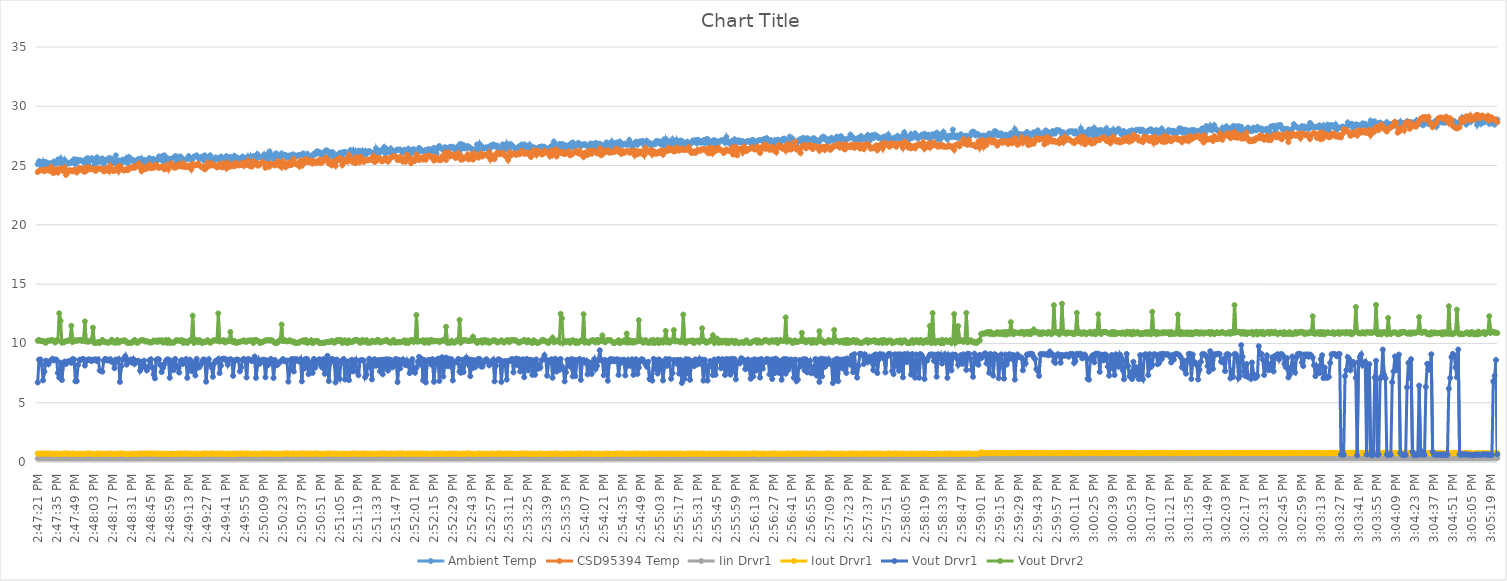
| Category | Ambient Temp | CSD95394 Temp | Iin Drvr1 | Iout Drvr1 | Vout Drvr1 | Vout Drvr2 |
|---|---|---|---|---|---|---|
| 0.616215277777816 | 25.106 | 24.447 | 0.298 | 0.714 | 6.706 | 10.23 |
| 0.61622685185189 | 25.369 | 24.546 | 0.292 | 0.696 | 8.622 | 10.301 |
| 0.616238425925964 | 25.303 | 24.612 | 0.298 | 0.71 | 8.658 | 10.217 |
| 0.616250000000038 | 24.908 | 24.612 | 0.299 | 0.72 | 8.225 | 10.19 |
| 0.616261574074112 | 25.336 | 24.612 | 0.299 | 0.716 | 6.888 | 10.207 |
| 0.616273148148186 | 24.974 | 24.513 | 0.301 | 0.719 | 7.621 | 10.135 |
| 0.61628472222226 | 25.303 | 24.678 | 0.291 | 0.689 | 8.546 | 10.045 |
| 0.616296296296334 | 25.138 | 24.678 | 0.3 | 0.718 | 8.482 | 10.218 |
| 0.616307870370408 | 25.171 | 24.579 | 0.298 | 0.709 | 8.239 | 10.237 |
| 0.616319444444482 | 25.204 | 24.579 | 0.3 | 0.717 | 8.493 | 10.237 |
| 0.616331018518556 | 25.04 | 24.875 | 0.295 | 0.7 | 8.594 | 10.271 |
| 0.61634259259263 | 25.04 | 24.414 | 0.285 | 0.68 | 8.71 | 10.281 |
| 0.616354166666704 | 25.336 | 24.381 | 0.286 | 0.678 | 8.574 | 10.189 |
| 0.616365740740778 | 25.171 | 24.612 | 0.293 | 0.693 | 8.633 | 10.072 |
| 0.616377314814852 | 25.171 | 24.678 | 0.297 | 0.709 | 8.636 | 10.263 |
| 0.616388888888927 | 25.501 | 24.414 | 0.296 | 0.704 | 7.507 | 10.255 |
| 0.616400462963001 | 25.336 | 24.711 | 0.282 | 0.669 | 7.115 | 12.547 |
| 0.616412037037075 | 25.599 | 24.776 | 0.286 | 0.681 | 8.379 | 11.914 |
| 0.616423611111149 | 25.073 | 24.645 | 0.293 | 0.695 | 6.905 | 10.059 |
| 0.616435185185223 | 25.04 | 24.546 | 0.297 | 0.71 | 8.222 | 10.088 |
| 0.616446759259297 | 25.468 | 24.809 | 0.299 | 0.707 | 8.464 | 10.111 |
| 0.616458333333371 | 25.138 | 24.217 | 0.301 | 0.721 | 8.262 | 10.197 |
| 0.616469907407445 | 25.138 | 24.381 | 0.299 | 0.716 | 8.448 | 10.201 |
| 0.616481481481519 | 25.237 | 24.579 | 0.297 | 0.705 | 8.506 | 10.27 |
| 0.616493055555593 | 25.237 | 24.612 | 0.285 | 0.679 | 8.491 | 10.26 |
| 0.616504629629667 | 25.237 | 24.546 | 0.285 | 0.677 | 8.368 | 11.486 |
| 0.616516203703741 | 25.402 | 24.513 | 0.299 | 0.716 | 8.686 | 10.122 |
| 0.616527777777815 | 25.534 | 24.645 | 0.294 | 0.702 | 8.636 | 10.26 |
| 0.616539351851889 | 25.138 | 24.612 | 0.285 | 0.68 | 6.804 | 10.256 |
| 0.616550925925963 | 25.501 | 24.414 | 0.287 | 0.68 | 6.82 | 10.214 |
| 0.616562500000037 | 25.336 | 24.612 | 0.288 | 0.682 | 8.198 | 10.278 |
| 0.616574074074111 | 25.468 | 24.809 | 0.292 | 0.698 | 8.626 | 10.286 |
| 0.616585648148185 | 25.435 | 24.645 | 0.291 | 0.692 | 8.597 | 10.308 |
| 0.616597222222259 | 25.402 | 24.743 | 0.285 | 0.682 | 8.678 | 10.197 |
| 0.616608796296333 | 25.303 | 24.513 | 0.288 | 0.689 | 8.68 | 10.303 |
| 0.616620370370407 | 25.171 | 24.48 | 0.284 | 0.676 | 8.134 | 11.857 |
| 0.616631944444481 | 25.566 | 24.842 | 0.298 | 0.715 | 8.486 | 10.155 |
| 0.616643518518555 | 25.632 | 24.612 | 0.3 | 0.72 | 8.625 | 10.183 |
| 0.616655092592629 | 24.974 | 24.842 | 0.301 | 0.716 | 8.657 | 10.152 |
| 0.616666666666703 | 25.435 | 24.776 | 0.3 | 0.713 | 8.634 | 10.223 |
| 0.616678240740777 | 25.632 | 24.678 | 0.288 | 0.684 | 8.503 | 10.285 |
| 0.616689814814852 | 25.501 | 24.711 | 0.281 | 0.67 | 8.63 | 11.331 |
| 0.616701388888926 | 25.007 | 24.743 | 0.287 | 0.68 | 8.596 | 10.036 |
| 0.616712962963 | 25.204 | 24.546 | 0.282 | 0.669 | 8.662 | 10.037 |
| 0.616724537037074 | 25.698 | 24.743 | 0.297 | 0.704 | 8.51 | 10.079 |
| 0.616736111111148 | 25.27 | 24.711 | 0.299 | 0.711 | 8.649 | 10.119 |
| 0.616747685185222 | 25.336 | 24.743 | 0.289 | 0.688 | 7.722 | 10.023 |
| 0.616759259259296 | 25.501 | 24.743 | 0.298 | 0.708 | 7.68 | 10.128 |
| 0.61677083333337 | 25.599 | 24.678 | 0.291 | 0.691 | 7.615 | 10.297 |
| 0.616782407407444 | 25.138 | 24.513 | 0.285 | 0.678 | 8.518 | 10.142 |
| 0.616793981481518 | 25.303 | 24.546 | 0.284 | 0.676 | 8.688 | 10.134 |
| 0.616805555555592 | 25.501 | 24.776 | 0.296 | 0.706 | 8.665 | 10.098 |
| 0.616817129629666 | 25.468 | 24.776 | 0.292 | 0.694 | 8.559 | 10.064 |
| 0.61682870370374 | 25.632 | 24.513 | 0.295 | 0.704 | 8.57 | 10.072 |
| 0.616840277777814 | 25.27 | 25.007 | 0.298 | 0.714 | 8.674 | 10.172 |
| 0.616851851851888 | 25.566 | 24.711 | 0.291 | 0.693 | 8.447 | 10.315 |
| 0.616863425925962 | 25.336 | 24.546 | 0.281 | 0.669 | 8.427 | 10.101 |
| 0.616875000000036 | 25.204 | 24.579 | 0.283 | 0.667 | 7.906 | 10.075 |
| 0.61688657407411 | 25.863 | 24.678 | 0.291 | 0.69 | 8.636 | 10.062 |
| 0.616898148148184 | 25.402 | 24.842 | 0.291 | 0.697 | 8.515 | 10.291 |
| 0.616909722222258 | 24.941 | 24.513 | 0.289 | 0.693 | 8.671 | 10.06 |
| 0.616921296296332 | 25.402 | 24.974 | 0.301 | 0.718 | 6.752 | 10.135 |
| 0.616932870370406 | 25.204 | 24.776 | 0.3 | 0.716 | 8.08 | 10.213 |
| 0.61694444444448 | 25.501 | 24.678 | 0.299 | 0.713 | 8.652 | 10.218 |
| 0.616956018518554 | 25.336 | 24.579 | 0.287 | 0.681 | 8.663 | 10.262 |
| 0.616967592592628 | 25.336 | 24.612 | 0.285 | 0.681 | 8.932 | 10.253 |
| 0.616979166666702 | 25.632 | 24.711 | 0.287 | 0.679 | 8.212 | 10.078 |
| 0.616990740740777 | 25.204 | 24.612 | 0.282 | 0.672 | 8.603 | 10.047 |
| 0.617002314814851 | 25.698 | 24.809 | 0.283 | 0.671 | 8.464 | 10.063 |
| 0.617013888888925 | 25.468 | 24.776 | 0.282 | 0.665 | 8.633 | 10.048 |
| 0.617025462962999 | 25.501 | 24.809 | 0.294 | 0.698 | 8.39 | 10.06 |
| 0.617037037037073 | 25.369 | 24.941 | 0.298 | 0.711 | 8.673 | 10.191 |
| 0.617048611111147 | 25.435 | 24.809 | 0.292 | 0.696 | 8.284 | 10.299 |
| 0.617060185185221 | 25.336 | 24.941 | 0.285 | 0.682 | 8.531 | 10.094 |
| 0.617071759259295 | 25.468 | 24.941 | 0.28 | 0.662 | 8.499 | 10.041 |
| 0.617083333333369 | 25.566 | 25.171 | 0.299 | 0.715 | 8.529 | 10.13 |
| 0.617094907407443 | 25.204 | 24.842 | 0.296 | 0.711 | 7.699 | 10.232 |
| 0.617106481481517 | 25.566 | 24.546 | 0.292 | 0.699 | 7.935 | 10.293 |
| 0.617118055555591 | 25.171 | 24.908 | 0.293 | 0.703 | 8.47 | 10.268 |
| 0.617129629629665 | 25.468 | 24.678 | 0.299 | 0.71 | 8.54 | 10.24 |
| 0.617141203703739 | 25.204 | 24.711 | 0.301 | 0.714 | 7.98 | 10.158 |
| 0.617152777777813 | 25.171 | 24.743 | 0.301 | 0.721 | 7.724 | 10.185 |
| 0.617164351851887 | 25.534 | 24.974 | 0.3 | 0.719 | 7.964 | 10.156 |
| 0.617175925925961 | 25.632 | 25.106 | 0.297 | 0.71 | 8.581 | 10.088 |
| 0.617187500000035 | 25.468 | 24.776 | 0.293 | 0.696 | 8.668 | 10.069 |
| 0.617199074074109 | 25.402 | 24.842 | 0.3 | 0.712 | 7.971 | 10.102 |
| 0.617210648148183 | 25.566 | 24.809 | 0.296 | 0.704 | 7.381 | 10.248 |
| 0.617222222222257 | 25.402 | 25.04 | 0.301 | 0.722 | 7.051 | 10.17 |
| 0.617233796296331 | 25.468 | 25.073 | 0.297 | 0.706 | 8.617 | 10.242 |
| 0.617245370370405 | 25.435 | 24.842 | 0.296 | 0.704 | 8.674 | 10.117 |
| 0.617256944444479 | 25.764 | 24.809 | 0.283 | 0.677 | 8.655 | 10.263 |
| 0.617268518518553 | 25.534 | 24.875 | 0.299 | 0.718 | 8.196 | 10.186 |
| 0.617280092592628 | 25.764 | 24.908 | 0.287 | 0.689 | 7.582 | 10.274 |
| 0.617291666666702 | 25.369 | 24.941 | 0.28 | 0.665 | 7.935 | 10.065 |
| 0.617303240740776 | 25.863 | 24.678 | 0.299 | 0.712 | 8.247 | 10.119 |
| 0.61731481481485 | 25.369 | 24.809 | 0.29 | 0.692 | 8.515 | 10.283 |
| 0.617326388888924 | 25.632 | 25.04 | 0.286 | 0.684 | 8.649 | 10.057 |
| 0.617337962962998 | 25.566 | 24.678 | 0.285 | 0.676 | 8.647 | 10.282 |
| 0.617349537037072 | 25.369 | 25.073 | 0.284 | 0.674 | 7.099 | 10.048 |
| 0.617361111111146 | 25.566 | 25.204 | 0.299 | 0.709 | 8.534 | 10.106 |
| 0.61737268518522 | 25.599 | 25.007 | 0.291 | 0.689 | 8.478 | 10.046 |
| 0.617384259259294 | 25.665 | 24.842 | 0.283 | 0.668 | 7.742 | 10.068 |
| 0.617395833333368 | 25.797 | 24.809 | 0.286 | 0.678 | 8.692 | 10.191 |
| 0.617407407407442 | 25.237 | 24.974 | 0.291 | 0.692 | 8.052 | 10.293 |
| 0.617418981481516 | 25.731 | 24.908 | 0.298 | 0.708 | 8.08 | 10.251 |
| 0.61743055555559 | 25.534 | 25.138 | 0.299 | 0.717 | 7.542 | 10.219 |
| 0.617442129629664 | 25.764 | 25.007 | 0.296 | 0.709 | 8.515 | 10.251 |
| 0.617453703703738 | 25.599 | 24.908 | 0.286 | 0.679 | 8.605 | 10.284 |
| 0.617465277777812 | 25.501 | 25.204 | 0.292 | 0.691 | 8.285 | 10.044 |
| 0.617476851851886 | 25.501 | 24.875 | 0.301 | 0.716 | 8.521 | 10.2 |
| 0.61748842592596 | 25.501 | 24.941 | 0.303 | 0.721 | 8.666 | 10.137 |
| 0.617500000000034 | 25.566 | 24.875 | 0.288 | 0.684 | 7.093 | 10.037 |
| 0.617511574074108 | 25.797 | 25.007 | 0.3 | 0.713 | 8.244 | 10.164 |
| 0.617523148148182 | 25.599 | 24.974 | 0.293 | 0.695 | 8.633 | 10.281 |
| 0.617534722222256 | 25.501 | 24.678 | 0.285 | 0.682 | 7.693 | 10.259 |
| 0.61754629629633 | 25.534 | 25.138 | 0.287 | 0.679 | 7.689 | 12.343 |
| 0.617557870370404 | 25.764 | 25.007 | 0.288 | 0.687 | 8.42 | 10.049 |
| 0.617569444444478 | 25.797 | 25.04 | 0.3 | 0.72 | 7.299 | 10.171 |
| 0.617581018518553 | 25.863 | 25.04 | 0.288 | 0.686 | 8.703 | 10.293 |
| 0.617592592592627 | 25.698 | 25.171 | 0.285 | 0.678 | 7.957 | 10.103 |
| 0.617604166666701 | 25.566 | 25.007 | 0.292 | 0.7 | 8.003 | 10.286 |
| 0.617615740740775 | 25.665 | 24.941 | 0.285 | 0.674 | 8.215 | 10.205 |
| 0.617627314814849 | 25.764 | 24.842 | 0.282 | 0.673 | 8.478 | 10.037 |
| 0.617638888888923 | 25.468 | 24.941 | 0.297 | 0.71 | 8.661 | 10.108 |
| 0.617650462962997 | 25.863 | 24.678 | 0.301 | 0.716 | 8.597 | 10.134 |
| 0.617662037037071 | 25.402 | 24.809 | 0.298 | 0.714 | 6.772 | 10.127 |
| 0.617673611111145 | 25.501 | 25.237 | 0.295 | 0.702 | 8.511 | 10.282 |
| 0.617685185185219 | 25.632 | 24.941 | 0.285 | 0.681 | 8.672 | 10.177 |
| 0.617696759259293 | 25.863 | 25.007 | 0.293 | 0.7 | 8.196 | 10.057 |
| 0.617708333333367 | 25.599 | 25.204 | 0.299 | 0.713 | 7.976 | 10.126 |
| 0.617719907407441 | 25.501 | 25.007 | 0.298 | 0.71 | 7.185 | 10.239 |
| 0.617731481481515 | 25.468 | 25.04 | 0.296 | 0.705 | 8.312 | 10.26 |
| 0.617743055555589 | 25.698 | 25.007 | 0.291 | 0.693 | 8.528 | 10.276 |
| 0.617754629629663 | 25.632 | 24.842 | 0.296 | 0.705 | 8.503 | 10.225 |
| 0.617766203703737 | 25.468 | 24.974 | 0.283 | 0.669 | 8.683 | 12.539 |
| 0.617777777777811 | 25.501 | 25.138 | 0.299 | 0.719 | 7.493 | 10.161 |
| 0.617789351851885 | 25.764 | 24.875 | 0.297 | 0.707 | 8.122 | 10.237 |
| 0.617800925925959 | 25.665 | 24.842 | 0.3 | 0.716 | 8.701 | 10.211 |
| 0.617812500000033 | 25.237 | 25.204 | 0.287 | 0.686 | 8.712 | 10.281 |
| 0.617824074074107 | 25.501 | 25.073 | 0.279 | 0.661 | 8.705 | 10.081 |
| 0.617835648148181 | 25.797 | 24.776 | 0.299 | 0.717 | 8.547 | 10.147 |
| 0.617847222222255 | 25.599 | 25.204 | 0.285 | 0.683 | 8.208 | 10.254 |
| 0.617858796296329 | 25.599 | 24.875 | 0.295 | 0.708 | 8.623 | 10.188 |
| 0.617870370370403 | 25.731 | 25.073 | 0.28 | 0.667 | 8.669 | 10.968 |
| 0.617881944444478 | 25.468 | 24.941 | 0.297 | 0.707 | 8.619 | 10.266 |
| 0.617893518518552 | 25.468 | 25.106 | 0.282 | 0.665 | 7.265 | 10.098 |
| 0.617905092592626 | 25.83 | 24.941 | 0.297 | 0.713 | 8.486 | 10.211 |
| 0.6179166666667 | 25.665 | 25.237 | 0.282 | 0.67 | 8.623 | 10.05 |
| 0.617928240740774 | 25.665 | 25.073 | 0.293 | 0.699 | 8.642 | 10.056 |
| 0.617939814814848 | 25.534 | 25.007 | 0.298 | 0.706 | 8.617 | 10.104 |
| 0.617951388888922 | 25.599 | 25.073 | 0.301 | 0.716 | 7.644 | 10.154 |
| 0.617962962962996 | 25.534 | 25.04 | 0.3 | 0.715 | 7.991 | 10.158 |
| 0.61797453703707 | 25.764 | 25.237 | 0.302 | 0.718 | 8.626 | 10.194 |
| 0.617986111111144 | 25.665 | 24.974 | 0.295 | 0.705 | 8.698 | 10.26 |
| 0.617997685185218 | 25.566 | 25.204 | 0.284 | 0.675 | 8.55 | 10.145 |
| 0.618009259259292 | 25.402 | 25.073 | 0.3 | 0.714 | 7.128 | 10.14 |
| 0.618020833333366 | 25.764 | 25.402 | 0.297 | 0.712 | 8.673 | 10.238 |
| 0.61803240740744 | 25.369 | 24.974 | 0.298 | 0.711 | 8.662 | 10.252 |
| 0.618043981481514 | 25.764 | 24.974 | 0.288 | 0.684 | 8.579 | 10.233 |
| 0.618055555555588 | 25.369 | 24.908 | 0.285 | 0.679 | 8.505 | 10.265 |
| 0.618067129629662 | 25.797 | 25.369 | 0.288 | 0.687 | 8.574 | 10.036 |
| 0.618078703703736 | 25.764 | 25.138 | 0.293 | 0.701 | 8.897 | 10.277 |
| 0.61809027777781 | 25.501 | 25.237 | 0.294 | 0.698 | 7.094 | 10.295 |
| 0.618101851851884 | 25.961 | 25.007 | 0.285 | 0.681 | 8.18 | 10.207 |
| 0.618113425925958 | 25.731 | 25.007 | 0.284 | 0.676 | 8.632 | 10.188 |
| 0.618125000000032 | 25.731 | 25.171 | 0.29 | 0.691 | 8.307 | 10.029 |
| 0.618136574074106 | 25.698 | 25.171 | 0.298 | 0.706 | 8.48 | 10.106 |
| 0.61814814814818 | 25.599 | 25.336 | 0.3 | 0.716 | 8.629 | 10.11 |
| 0.618159722222254 | 25.929 | 25.138 | 0.3 | 0.712 | 8.63 | 10.195 |
| 0.618171296296328 | 25.599 | 24.809 | 0.299 | 0.711 | 7.142 | 10.248 |
| 0.618182870370403 | 25.863 | 24.941 | 0.295 | 0.7 | 8.569 | 10.269 |
| 0.618194444444477 | 25.534 | 25.138 | 0.295 | 0.707 | 8.183 | 10.281 |
| 0.618206018518551 | 26.192 | 24.908 | 0.296 | 0.703 | 8.407 | 10.25 |
| 0.618217592592625 | 25.83 | 25.171 | 0.29 | 0.69 | 8.693 | 10.29 |
| 0.618229166666699 | 25.83 | 25.106 | 0.294 | 0.705 | 8.543 | 10.257 |
| 0.618240740740773 | 25.566 | 25.106 | 0.284 | 0.679 | 7.081 | 10.152 |
| 0.618252314814847 | 25.961 | 25.007 | 0.291 | 0.69 | 8.608 | 10.044 |
| 0.618263888888921 | 26.027 | 25.138 | 0.29 | 0.691 | 8.156 | 10.054 |
| 0.618275462962995 | 25.731 | 25.369 | 0.296 | 0.702 | 8.203 | 10.061 |
| 0.618287037037069 | 25.797 | 25.007 | 0.298 | 0.707 | 8.342 | 10.236 |
| 0.618298611111143 | 25.698 | 25.171 | 0.286 | 0.678 | 8.473 | 10.259 |
| 0.618310185185217 | 26.027 | 24.875 | 0.284 | 0.67 | 8.551 | 11.591 |
| 0.618321759259291 | 25.863 | 25.369 | 0.299 | 0.716 | 8.685 | 10.204 |
| 0.618333333333365 | 25.896 | 25.171 | 0.295 | 0.702 | 8.5 | 10.296 |
| 0.618344907407439 | 25.896 | 24.875 | 0.301 | 0.715 | 8.494 | 10.2 |
| 0.618356481481513 | 25.665 | 25.171 | 0.301 | 0.722 | 8.556 | 10.168 |
| 0.618368055555587 | 25.764 | 25.007 | 0.299 | 0.716 | 6.776 | 10.196 |
| 0.618379629629661 | 25.863 | 25.27 | 0.297 | 0.705 | 7.805 | 10.274 |
| 0.618391203703735 | 25.468 | 25.04 | 0.284 | 0.677 | 8.649 | 10.19 |
| 0.618402777777809 | 25.929 | 25.106 | 0.298 | 0.713 | 8.691 | 10.131 |
| 0.618414351851883 | 25.929 | 25.566 | 0.303 | 0.72 | 7.633 | 10.162 |
| 0.618425925925957 | 25.797 | 25.171 | 0.285 | 0.679 | 8.669 | 10.037 |
| 0.618437500000031 | 25.764 | 25.106 | 0.296 | 0.7 | 8.674 | 10.067 |
| 0.618449074074105 | 25.863 | 25.204 | 0.291 | 0.69 | 8.52 | 10.052 |
| 0.618460648148179 | 25.896 | 24.941 | 0.297 | 0.705 | 8.48 | 10.075 |
| 0.618472222222254 | 25.863 | 25.435 | 0.299 | 0.715 | 8.687 | 10.167 |
| 0.618483796296328 | 25.929 | 24.974 | 0.303 | 0.718 | 6.798 | 10.186 |
| 0.618495370370402 | 26.027 | 25.369 | 0.295 | 0.706 | 8.585 | 10.259 |
| 0.618506944444476 | 25.83 | 25.237 | 0.297 | 0.707 | 7.884 | 10.116 |
| 0.61851851851855 | 25.83 | 25.534 | 0.295 | 0.701 | 8.701 | 10.295 |
| 0.618530092592624 | 25.994 | 25.501 | 0.29 | 0.687 | 8.677 | 10.041 |
| 0.618541666666698 | 25.698 | 25.27 | 0.3 | 0.708 | 7.408 | 10.096 |
| 0.618553240740772 | 25.665 | 25.27 | 0.299 | 0.715 | 8.372 | 10.117 |
| 0.618564814814846 | 25.797 | 25.435 | 0.292 | 0.698 | 8.386 | 10.274 |
| 0.61857638888892 | 25.863 | 25.171 | 0.283 | 0.667 | 7.514 | 10.027 |
| 0.618587962962994 | 25.994 | 25.369 | 0.298 | 0.708 | 8.692 | 10.088 |
| 0.618599537037068 | 25.929 | 25.336 | 0.299 | 0.711 | 7.958 | 10.203 |
| 0.618611111111142 | 26.192 | 25.204 | 0.301 | 0.715 | 8.411 | 10.218 |
| 0.618622685185216 | 26.192 | 25.303 | 0.3 | 0.715 | 8.578 | 10.189 |
| 0.61863425925929 | 26.027 | 25.501 | 0.286 | 0.676 | 8.667 | 10.026 |
| 0.618645833333364 | 26.093 | 25.204 | 0.287 | 0.686 | 8.17 | 10.037 |
| 0.618657407407438 | 25.896 | 25.303 | 0.291 | 0.688 | 7.973 | 10.038 |
| 0.618668981481512 | 25.961 | 25.336 | 0.281 | 0.669 | 8.676 | 10.069 |
| 0.618680555555586 | 26.192 | 25.599 | 0.292 | 0.693 | 7.437 | 10.053 |
| 0.61869212962966 | 26.291 | 25.665 | 0.297 | 0.707 | 8.681 | 10.101 |
| 0.618703703703734 | 26.258 | 25.435 | 0.301 | 0.714 | 8.956 | 10.131 |
| 0.618715277777808 | 25.764 | 25.171 | 0.301 | 0.714 | 6.821 | 10.135 |
| 0.618726851851882 | 25.863 | 25.336 | 0.302 | 0.717 | 8.352 | 10.122 |
| 0.618738425925956 | 26.126 | 25.04 | 0.297 | 0.706 | 8.669 | 10.227 |
| 0.61875000000003 | 26.126 | 25.336 | 0.284 | 0.672 | 8.677 | 10.191 |
| 0.618761574074104 | 25.665 | 25.204 | 0.294 | 0.699 | 8.594 | 10.056 |
| 0.618773148148179 | 25.797 | 24.974 | 0.299 | 0.714 | 6.708 | 10.123 |
| 0.618784722222253 | 25.896 | 25.501 | 0.295 | 0.705 | 8.64 | 10.287 |
| 0.618796296296327 | 25.665 | 25.435 | 0.286 | 0.684 | 7.205 | 10.195 |
| 0.618807870370401 | 26.06 | 25.632 | 0.292 | 0.697 | 7.011 | 10.301 |
| 0.618819444444475 | 26.093 | 25.566 | 0.291 | 0.688 | 8.402 | 10.289 |
| 0.618831018518549 | 25.731 | 25.04 | 0.288 | 0.682 | 8.576 | 10.04 |
| 0.618842592592623 | 26.126 | 25.27 | 0.3 | 0.716 | 8.681 | 10.195 |
| 0.618854166666697 | 26.159 | 25.336 | 0.29 | 0.688 | 6.96 | 10.266 |
| 0.618865740740771 | 26.06 | 25.534 | 0.288 | 0.687 | 8.077 | 10.049 |
| 0.618877314814845 | 26.027 | 25.336 | 0.288 | 0.686 | 8.485 | 10.036 |
| 0.618888888888919 | 25.994 | 25.863 | 0.289 | 0.683 | 6.9 | 10.259 |
| 0.618900462962993 | 26.291 | 25.566 | 0.279 | 0.666 | 7.902 | 10.101 |
| 0.618912037037067 | 25.994 | 25.468 | 0.299 | 0.713 | 8.633 | 10.111 |
| 0.618923611111141 | 26.258 | 25.27 | 0.299 | 0.716 | 7.638 | 10.149 |
| 0.618935185185215 | 25.599 | 25.599 | 0.296 | 0.705 | 8.382 | 10.288 |
| 0.618946759259289 | 26.159 | 25.204 | 0.297 | 0.706 | 8.615 | 10.255 |
| 0.618958333333363 | 25.863 | 25.698 | 0.288 | 0.688 | 7.645 | 10.294 |
| 0.618969907407437 | 26.258 | 25.599 | 0.299 | 0.708 | 7.319 | 10.229 |
| 0.618981481481511 | 26.225 | 25.303 | 0.282 | 0.666 | 8.551 | 10.058 |
| 0.618993055555585 | 25.83 | 25.698 | 0.296 | 0.699 | 8.588 | 10.075 |
| 0.619004629629659 | 26.225 | 25.468 | 0.285 | 0.68 | 8.599 | 10.296 |
| 0.619016203703733 | 25.929 | 25.303 | 0.3 | 0.717 | 8.543 | 10.157 |
| 0.619027777777807 | 26.225 | 25.402 | 0.302 | 0.715 | 7.152 | 10.141 |
| 0.619039351851881 | 25.961 | 25.501 | 0.292 | 0.701 | 7.365 | 10.289 |
| 0.619050925925955 | 26.192 | 25.435 | 0.291 | 0.691 | 8.164 | 10.046 |
| 0.619062500000029 | 26.225 | 25.501 | 0.296 | 0.701 | 8.711 | 10.066 |
| 0.619074074074104 | 26.159 | 25.534 | 0.296 | 0.702 | 8.004 | 10.069 |
| 0.619085648148178 | 26.093 | 25.468 | 0.297 | 0.71 | 6.963 | 10.229 |
| 0.619097222222252 | 25.994 | 25.797 | 0.285 | 0.676 | 8.6 | 10.206 |
| 0.619108796296326 | 25.896 | 25.303 | 0.284 | 0.671 | 8.664 | 10.115 |
| 0.6191203703704 | 26.455 | 25.369 | 0.299 | 0.708 | 8.119 | 10.125 |
| 0.619131944444474 | 26.126 | 25.665 | 0.295 | 0.699 | 8.506 | 10.297 |
| 0.619143518518548 | 26.258 | 25.632 | 0.289 | 0.691 | 8.595 | 10.271 |
| 0.619155092592622 | 26.093 | 25.599 | 0.296 | 0.701 | 7.648 | 10.082 |
| 0.619166666666696 | 26.291 | 25.369 | 0.301 | 0.719 | 8.627 | 10.13 |
| 0.61917824074077 | 26.356 | 25.369 | 0.301 | 0.713 | 7.397 | 10.153 |
| 0.619189814814844 | 26.554 | 25.566 | 0.301 | 0.714 | 8.625 | 10.216 |
| 0.619201388888918 | 25.994 | 25.468 | 0.298 | 0.713 | 7.92 | 10.238 |
| 0.619212962962992 | 26.389 | 25.632 | 0.29 | 0.688 | 8.672 | 10.3 |
| 0.619224537037066 | 26.159 | 25.336 | 0.285 | 0.679 | 7.708 | 10.128 |
| 0.61923611111114 | 26.126 | 25.501 | 0.298 | 0.706 | 8.648 | 10.101 |
| 0.619247685185214 | 26.422 | 25.665 | 0.293 | 0.692 | 8.593 | 10.049 |
| 0.619259259259288 | 26.06 | 25.731 | 0.3 | 0.713 | 7.974 | 10.214 |
| 0.619270833333362 | 26.192 | 25.797 | 0.289 | 0.686 | 8.057 | 10.299 |
| 0.619282407407436 | 26.192 | 25.797 | 0.293 | 0.7 | 8.642 | 10.065 |
| 0.61929398148151 | 26.291 | 25.698 | 0.298 | 0.706 | 8.691 | 10.093 |
| 0.619305555555584 | 26.356 | 25.468 | 0.299 | 0.709 | 6.738 | 10.087 |
| 0.619317129629658 | 26.291 | 25.468 | 0.3 | 0.712 | 8.618 | 10.136 |
| 0.619328703703732 | 26.356 | 25.731 | 0.3 | 0.715 | 7.899 | 10.092 |
| 0.619340277777806 | 26.225 | 25.632 | 0.301 | 0.714 | 8.483 | 10.134 |
| 0.61935185185188 | 26.093 | 25.336 | 0.301 | 0.72 | 8.655 | 10.167 |
| 0.619363425925955 | 26.324 | 25.534 | 0.289 | 0.685 | 8.277 | 10.268 |
| 0.619375000000029 | 26.06 | 25.336 | 0.283 | 0.672 | 8.166 | 10.043 |
| 0.619386574074103 | 26.291 | 25.929 | 0.298 | 0.714 | 8.544 | 10.23 |
| 0.619398148148177 | 26.422 | 25.599 | 0.289 | 0.685 | 8.176 | 10.039 |
| 0.619409722222251 | 25.994 | 25.632 | 0.299 | 0.717 | 7.491 | 10.196 |
| 0.619421296296325 | 26.027 | 25.204 | 0.294 | 0.703 | 8.391 | 10.296 |
| 0.619432870370399 | 26.324 | 25.402 | 0.294 | 0.698 | 8.672 | 10.278 |
| 0.619444444444473 | 26.389 | 25.566 | 0.301 | 0.714 | 7.685 | 10.118 |
| 0.619456018518547 | 26.126 | 25.402 | 0.293 | 0.701 | 7.53 | 10.265 |
| 0.619467592592621 | 26.093 | 25.929 | 0.283 | 0.672 | 7.929 | 12.4 |
| 0.619479166666695 | 26.159 | 25.764 | 0.302 | 0.718 | 8.444 | 10.139 |
| 0.619490740740769 | 26.488 | 25.468 | 0.3 | 0.713 | 8.874 | 10.189 |
| 0.619502314814843 | 26.389 | 25.665 | 0.284 | 0.675 | 8.214 | 10.2 |
| 0.619513888888917 | 26.192 | 25.599 | 0.3 | 0.719 | 8.692 | 10.18 |
| 0.619525462962991 | 26.225 | 25.501 | 0.291 | 0.696 | 6.886 | 10.274 |
| 0.619537037037065 | 26.159 | 25.764 | 0.292 | 0.689 | 8.596 | 10.057 |
| 0.619548611111139 | 26.324 | 25.501 | 0.3 | 0.715 | 6.714 | 10.216 |
| 0.619560185185213 | 26.159 | 25.764 | 0.294 | 0.703 | 8.534 | 10.277 |
| 0.619571759259287 | 26.389 | 25.863 | 0.289 | 0.683 | 8.608 | 10.054 |
| 0.619583333333361 | 26.258 | 25.797 | 0.283 | 0.673 | 8.619 | 10.119 |
| 0.619594907407435 | 26.356 | 25.698 | 0.292 | 0.699 | 8.213 | 10.306 |
| 0.619606481481509 | 26.192 | 25.731 | 0.285 | 0.676 | 8.679 | 10.164 |
| 0.619618055555583 | 26.488 | 25.435 | 0.297 | 0.704 | 6.759 | 10.224 |
| 0.619629629629657 | 26.356 | 25.731 | 0.285 | 0.673 | 8.265 | 10.178 |
| 0.619641203703731 | 25.994 | 25.501 | 0.3 | 0.718 | 8.571 | 10.205 |
| 0.619652777777805 | 26.521 | 25.566 | 0.298 | 0.711 | 8.708 | 10.22 |
| 0.61966435185188 | 26.653 | 25.468 | 0.28 | 0.665 | 6.832 | 10.101 |
| 0.619675925925954 | 26.455 | 25.435 | 0.301 | 0.715 | 8.403 | 10.185 |
| 0.619687500000028 | 26.422 | 25.764 | 0.299 | 0.712 | 8.833 | 10.241 |
| 0.619699074074102 | 26.324 | 25.764 | 0.293 | 0.697 | 7.204 | 10.302 |
| 0.619710648148176 | 26.554 | 26.06 | 0.288 | 0.68 | 8.424 | 10.209 |
| 0.61972222222225 | 26.488 | 25.468 | 0.285 | 0.679 | 8.806 | 11.404 |
| 0.619733796296324 | 26.488 | 25.863 | 0.291 | 0.688 | 8.077 | 10.041 |
| 0.619745370370398 | 26.159 | 26.093 | 0.298 | 0.706 | 8.709 | 10.08 |
| 0.619756944444472 | 26.587 | 25.764 | 0.296 | 0.7 | 8.073 | 10.055 |
| 0.619768518518546 | 26.554 | 25.896 | 0.295 | 0.707 | 8.673 | 10.234 |
| 0.61978009259262 | 26.587 | 25.83 | 0.285 | 0.672 | 6.877 | 10.144 |
| 0.619791666666694 | 26.389 | 25.929 | 0.291 | 0.695 | 8.441 | 10.054 |
| 0.619803240740768 | 26.389 | 25.632 | 0.299 | 0.711 | 8.417 | 10.124 |
| 0.619814814814842 | 26.356 | 25.698 | 0.297 | 0.711 | 8.412 | 10.266 |
| 0.619826388888916 | 26.653 | 26.06 | 0.285 | 0.681 | 8.693 | 10.183 |
| 0.61983796296299 | 26.027 | 25.929 | 0.286 | 0.682 | 7.631 | 11.982 |
| 0.619849537037064 | 26.817 | 25.501 | 0.281 | 0.67 | 7.529 | 10.066 |
| 0.619861111111138 | 26.455 | 25.501 | 0.3 | 0.714 | 8.633 | 10.203 |
| 0.619872685185212 | 26.719 | 25.698 | 0.293 | 0.694 | 7.585 | 10.29 |
| 0.619884259259286 | 26.455 | 25.632 | 0.289 | 0.691 | 8.519 | 10.262 |
| 0.61989583333336 | 26.455 | 25.599 | 0.298 | 0.711 | 8.802 | 10.273 |
| 0.619907407407434 | 26.653 | 25.929 | 0.3 | 0.716 | 8.308 | 10.209 |
| 0.619918981481508 | 26.587 | 25.534 | 0.301 | 0.722 | 8.651 | 10.187 |
| 0.619930555555582 | 26.455 | 25.731 | 0.296 | 0.703 | 7.234 | 10.271 |
| 0.619942129629656 | 26.422 | 25.929 | 0.286 | 0.676 | 8.622 | 10.232 |
| 0.61995370370373 | 26.258 | 25.501 | 0.29 | 0.687 | 7.945 | 10.556 |
| 0.619965277777805 | 26.356 | 26.027 | 0.287 | 0.688 | 8.586 | 10.278 |
| 0.619976851851879 | 26.291 | 25.797 | 0.286 | 0.681 | 8.039 | 10.189 |
| 0.619988425925953 | 26.784 | 25.764 | 0.288 | 0.686 | 8.257 | 10.038 |
| 0.620000000000027 | 26.324 | 25.665 | 0.301 | 0.715 | 8.704 | 10.2 |
| 0.620011574074101 | 26.817 | 25.929 | 0.298 | 0.712 | 8.679 | 10.147 |
| 0.620023148148175 | 26.488 | 26.027 | 0.288 | 0.688 | 8.057 | 10.259 |
| 0.620034722222249 | 26.587 | 25.764 | 0.292 | 0.691 | 8.04 | 10.066 |
| 0.620046296296323 | 26.422 | 25.896 | 0.297 | 0.707 | 8.364 | 10.273 |
| 0.620057870370397 | 26.488 | 25.896 | 0.288 | 0.682 | 8.583 | 10.273 |
| 0.620069444444471 | 26.554 | 25.929 | 0.296 | 0.704 | 8.67 | 10.093 |
| 0.620081018518545 | 26.389 | 25.797 | 0.284 | 0.676 | 8.518 | 10.242 |
| 0.620092592592619 | 26.291 | 26.093 | 0.293 | 0.691 | 8.164 | 10.053 |
| 0.620104166666693 | 26.686 | 25.501 | 0.299 | 0.709 | 8.375 | 10.108 |
| 0.620115740740767 | 26.587 | 25.764 | 0.302 | 0.717 | 8.448 | 10.197 |
| 0.620127314814841 | 26.784 | 25.863 | 0.292 | 0.691 | 8.63 | 10.272 |
| 0.620138888888915 | 26.719 | 25.566 | 0.288 | 0.688 | 6.803 | 10.267 |
| 0.620150462962989 | 26.587 | 25.863 | 0.286 | 0.681 | 8.11 | 10.222 |
| 0.620162037037063 | 26.686 | 26.093 | 0.295 | 0.705 | 8.569 | 10.073 |
| 0.620173611111137 | 26.389 | 26.06 | 0.3 | 0.718 | 8.667 | 10.122 |
| 0.620185185185211 | 26.422 | 25.961 | 0.299 | 0.716 | 8.605 | 10.153 |
| 0.620196759259285 | 26.324 | 25.994 | 0.294 | 0.7 | 6.752 | 10.273 |
| 0.620208333333359 | 26.784 | 26.093 | 0.286 | 0.677 | 8.496 | 10.168 |
| 0.620219907407433 | 26.719 | 25.929 | 0.292 | 0.688 | 8.238 | 10.059 |
| 0.620231481481507 | 26.389 | 25.797 | 0.303 | 0.72 | 8.517 | 10.159 |
| 0.620243055555581 | 26.85 | 25.731 | 0.295 | 0.7 | 6.95 | 10.27 |
| 0.620254629629655 | 26.488 | 25.468 | 0.286 | 0.678 | 8.525 | 10.266 |
| 0.62026620370373 | 26.225 | 26.093 | 0.299 | 0.707 | 8.514 | 10.095 |
| 0.620277777777804 | 26.817 | 25.83 | 0.296 | 0.701 | 8.63 | 10.266 |
| 0.620289351851878 | 26.686 | 25.994 | 0.291 | 0.691 | 8.686 | 10.292 |
| 0.620300925925952 | 26.587 | 25.961 | 0.296 | 0.701 | 7.556 | 10.263 |
| 0.620312500000026 | 26.455 | 26.027 | 0.288 | 0.688 | 8.576 | 10.276 |
| 0.6203240740741 | 26.192 | 25.896 | 0.287 | 0.686 | 8.718 | 10.257 |
| 0.620335648148174 | 26.422 | 26.027 | 0.286 | 0.675 | 8.168 | 10.123 |
| 0.620347222222248 | 26.62 | 25.961 | 0.283 | 0.669 | 8.684 | 10.056 |
| 0.620358796296322 | 26.356 | 25.994 | 0.298 | 0.712 | 7.639 | 10.104 |
| 0.620370370370396 | 26.752 | 26.225 | 0.303 | 0.718 | 8.075 | 10.165 |
| 0.62038194444447 | 26.521 | 26.192 | 0.3 | 0.713 | 8.663 | 10.2 |
| 0.620393518518544 | 26.784 | 25.994 | 0.293 | 0.693 | 7.148 | 10.301 |
| 0.620405092592618 | 26.587 | 26.027 | 0.299 | 0.708 | 8.216 | 10.196 |
| 0.620416666666692 | 26.686 | 26.06 | 0.297 | 0.703 | 8.697 | 10.084 |
| 0.620428240740766 | 26.389 | 26.093 | 0.293 | 0.693 | 7.725 | 10.274 |
| 0.62043981481484 | 26.752 | 25.863 | 0.285 | 0.674 | 8.581 | 10.181 |
| 0.620451388888914 | 26.422 | 25.731 | 0.298 | 0.705 | 8.614 | 10.081 |
| 0.620462962962988 | 26.488 | 26.093 | 0.289 | 0.685 | 7.348 | 10.033 |
| 0.620474537037062 | 26.554 | 26.291 | 0.297 | 0.708 | 8.565 | 10.269 |
| 0.620486111111136 | 26.488 | 26.192 | 0.287 | 0.685 | 7.358 | 10.204 |
| 0.62049768518521 | 26.422 | 25.896 | 0.283 | 0.669 | 8.652 | 10.067 |
| 0.620509259259284 | 26.422 | 26.258 | 0.289 | 0.683 | 7.85 | 10.032 |
| 0.620520833333358 | 26.554 | 26.126 | 0.295 | 0.705 | 8.175 | 10.087 |
| 0.620532407407432 | 26.554 | 26.126 | 0.302 | 0.719 | 7.969 | 10.149 |
| 0.620543981481506 | 26.62 | 25.929 | 0.295 | 0.7 | 8.585 | 10.268 |
| 0.620555555555581 | 26.554 | 25.994 | 0.289 | 0.69 | 8.691 | 10.302 |
| 0.620567129629655 | 26.587 | 26.258 | 0.287 | 0.684 | 9.005 | 10.191 |
| 0.620578703703729 | 26.291 | 26.093 | 0.287 | 0.679 | 8.675 | 10.208 |
| 0.620590277777803 | 26.422 | 26.126 | 0.286 | 0.684 | 7.277 | 10.089 |
| 0.620601851851877 | 26.422 | 26.06 | 0.288 | 0.686 | 8.519 | 10.037 |
| 0.620613425925951 | 26.521 | 25.797 | 0.299 | 0.714 | 8.561 | 10.224 |
| 0.620625000000025 | 26.62 | 26.225 | 0.291 | 0.689 | 8.662 | 10.273 |
| 0.620636574074099 | 26.719 | 25.896 | 0.283 | 0.664 | 7.105 | 10.487 |
| 0.620648148148173 | 27.015 | 26.192 | 0.298 | 0.707 | 8.189 | 10.094 |
| 0.620659722222247 | 26.784 | 26.356 | 0.3 | 0.714 | 8.708 | 10.154 |
| 0.620671296296321 | 26.422 | 25.764 | 0.301 | 0.715 | 7.622 | 10.213 |
| 0.620682870370395 | 26.62 | 26.258 | 0.289 | 0.688 | 8.573 | 10.27 |
| 0.620694444444469 | 26.817 | 26.093 | 0.285 | 0.68 | 7.762 | 10.098 |
| 0.620706018518543 | 26.62 | 26.06 | 0.288 | 0.68 | 8.691 | 12.502 |
| 0.620717592592617 | 26.817 | 26.159 | 0.284 | 0.675 | 8.075 | 12.132 |
| 0.620729166666691 | 26.455 | 25.994 | 0.284 | 0.67 | 7.817 | 10.052 |
| 0.620740740740765 | 26.752 | 25.961 | 0.298 | 0.705 | 6.799 | 10.226 |
| 0.620752314814839 | 26.587 | 26.06 | 0.284 | 0.676 | 7.573 | 10.114 |
| 0.620763888888913 | 26.324 | 26.093 | 0.3 | 0.713 | 8.627 | 10.15 |
| 0.620775462962987 | 26.719 | 26.192 | 0.287 | 0.684 | 8.296 | 10.219 |
| 0.620787037037061 | 26.554 | 25.863 | 0.286 | 0.683 | 8.063 | 10.04 |
| 0.620798611111135 | 26.883 | 25.929 | 0.301 | 0.721 | 8.681 | 10.196 |
| 0.620810185185209 | 26.949 | 25.994 | 0.293 | 0.693 | 7.22 | 10.277 |
| 0.620821759259283 | 26.455 | 26.126 | 0.285 | 0.674 | 8.624 | 10.193 |
| 0.620833333333357 | 26.62 | 26.225 | 0.291 | 0.693 | 7.246 | 10.037 |
| 0.620844907407431 | 26.752 | 26.159 | 0.299 | 0.708 | 8.572 | 10.197 |
| 0.620856481481506 | 26.916 | 26.027 | 0.289 | 0.681 | 8.599 | 10.042 |
| 0.62086805555558 | 26.85 | 26.258 | 0.3 | 0.716 | 8.688 | 10.131 |
| 0.620879629629654 | 26.62 | 25.961 | 0.297 | 0.71 | 6.923 | 10.235 |
| 0.620891203703728 | 26.752 | 25.961 | 0.286 | 0.68 | 8.489 | 10.232 |
| 0.620902777777802 | 26.784 | 25.731 | 0.286 | 0.675 | 8.618 | 12.463 |
| 0.620914351851876 | 26.817 | 26.093 | 0.296 | 0.699 | 8.381 | 10.066 |
| 0.62092592592595 | 26.686 | 25.994 | 0.3 | 0.715 | 8.538 | 10.166 |
| 0.620937500000024 | 26.62 | 25.896 | 0.286 | 0.678 | 7.391 | 10.113 |
| 0.620949074074098 | 26.521 | 26.258 | 0.288 | 0.68 | 8.414 | 10.04 |
| 0.620960648148172 | 26.85 | 26.192 | 0.302 | 0.716 | 8.048 | 10.195 |
| 0.620972222222246 | 26.85 | 25.994 | 0.297 | 0.71 | 7.42 | 10.253 |
| 0.62098379629632 | 26.653 | 26.258 | 0.287 | 0.686 | 8.424 | 10.29 |
| 0.620995370370394 | 26.784 | 26.192 | 0.286 | 0.681 | 8.683 | 10.139 |
| 0.621006944444468 | 26.916 | 26.126 | 0.296 | 0.703 | 7.846 | 10.086 |
| 0.621018518518542 | 26.587 | 26.027 | 0.289 | 0.691 | 8.114 | 10.296 |
| 0.621030092592616 | 26.817 | 26.093 | 0.298 | 0.713 | 8.582 | 10.102 |
| 0.62104166666669 | 26.85 | 26.422 | 0.289 | 0.69 | 9.422 | 10.276 |
| 0.621053240740764 | 26.62 | 25.863 | 0.286 | 0.677 | 8.594 | 10.214 |
| 0.621064814814838 | 26.719 | 26.291 | 0.282 | 0.67 | 8.572 | 10.677 |
| 0.621076388888912 | 26.62 | 26.027 | 0.285 | 0.681 | 7.318 | 10.219 |
| 0.621087962962986 | 26.62 | 26.225 | 0.297 | 0.708 | 8.608 | 10.089 |
| 0.62109953703706 | 26.949 | 26.192 | 0.297 | 0.711 | 8.531 | 10.261 |
| 0.621111111111134 | 26.883 | 26.324 | 0.295 | 0.698 | 6.848 | 10.27 |
| 0.621122685185208 | 26.653 | 26.093 | 0.291 | 0.69 | 8.45 | 10.286 |
| 0.621134259259282 | 26.587 | 26.093 | 0.292 | 0.694 | 8.69 | 10.271 |
| 0.621145833333356 | 27.015 | 26.126 | 0.285 | 0.673 | 8.503 | 10.174 |
| 0.621157407407431 | 26.653 | 26.159 | 0.286 | 0.679 | 8.66 | 10.045 |
| 0.621168981481505 | 26.719 | 26.159 | 0.288 | 0.679 | 8.484 | 10.035 |
| 0.621180555555579 | 26.916 | 26.422 | 0.301 | 0.713 | 8.632 | 10.111 |
| 0.621192129629653 | 26.949 | 26.291 | 0.3 | 0.712 | 8.665 | 10.151 |
| 0.621203703703727 | 26.686 | 26.159 | 0.296 | 0.708 | 7.341 | 10.273 |
| 0.621215277777801 | 27.015 | 26.291 | 0.284 | 0.669 | 8.62 | 10.029 |
| 0.621226851851875 | 26.784 | 25.994 | 0.298 | 0.711 | 8.366 | 10.104 |
| 0.621238425925949 | 26.719 | 26.225 | 0.301 | 0.718 | 8.585 | 10.153 |
| 0.621250000000023 | 26.817 | 26.06 | 0.297 | 0.705 | 8.634 | 10.258 |
| 0.621261574074097 | 26.85 | 26.192 | 0.284 | 0.679 | 7.3 | 10.109 |
| 0.621273148148171 | 26.752 | 26.192 | 0.289 | 0.682 | 8.346 | 10.836 |
| 0.621284722222245 | 26.784 | 26.225 | 0.296 | 0.703 | 8.601 | 10.093 |
| 0.621296296296319 | 27.147 | 26.093 | 0.286 | 0.677 | 8.111 | 10.276 |
| 0.621307870370393 | 26.883 | 26.093 | 0.296 | 0.703 | 8.138 | 10.075 |
| 0.621319444444467 | 26.554 | 26.258 | 0.299 | 0.715 | 8.662 | 10.215 |
| 0.621331018518541 | 26.752 | 26.225 | 0.281 | 0.668 | 7.351 | 10.067 |
| 0.621342592592615 | 26.883 | 25.863 | 0.301 | 0.717 | 8.409 | 10.208 |
| 0.621354166666689 | 27.015 | 26.225 | 0.302 | 0.716 | 8.67 | 10.133 |
| 0.621365740740763 | 26.752 | 25.961 | 0.3 | 0.712 | 7.426 | 10.226 |
| 0.621377314814837 | 26.883 | 26.192 | 0.285 | 0.679 | 7.954 | 11.967 |
| 0.621388888888911 | 27.048 | 26.027 | 0.3 | 0.714 | 8.499 | 10.199 |
| 0.621400462962985 | 26.949 | 26.192 | 0.287 | 0.686 | 8.663 | 10.295 |
| 0.621412037037059 | 27.081 | 26.159 | 0.297 | 0.703 | 8.639 | 10.071 |
| 0.621423611111133 | 26.686 | 25.863 | 0.297 | 0.708 | 8.438 | 10.092 |
| 0.621435185185207 | 26.719 | 26.488 | 0.295 | 0.699 | 8.228 | 10.29 |
| 0.621446759259282 | 27.081 | 26.291 | 0.286 | 0.683 | 8.028 | 10.175 |
| 0.621458333333356 | 26.817 | 26.126 | 0.284 | 0.668 | 8.453 | 10.049 |
| 0.62146990740743 | 26.916 | 26.159 | 0.296 | 0.707 | 7 | 10.071 |
| 0.621481481481504 | 26.752 | 26.324 | 0.293 | 0.701 | 7.11 | 10.265 |
| 0.621493055555578 | 26.752 | 25.929 | 0.293 | 0.694 | 6.863 | 10.064 |
| 0.621504629629652 | 26.883 | 26.225 | 0.296 | 0.707 | 8.7 | 10.281 |
| 0.621516203703726 | 26.784 | 26.027 | 0.287 | 0.678 | 7.857 | 10.032 |
| 0.6215277777778 | 27.081 | 25.994 | 0.299 | 0.713 | 8.579 | 10.153 |
| 0.621539351851874 | 26.982 | 26.126 | 0.29 | 0.69 | 7.46 | 10.298 |
| 0.621550925925948 | 27.048 | 26.06 | 0.284 | 0.675 | 8.656 | 10.036 |
| 0.621562500000022 | 26.817 | 26.225 | 0.3 | 0.716 | 7.801 | 10.166 |
| 0.621574074074096 | 26.784 | 26.291 | 0.286 | 0.681 | 8.479 | 10.27 |
| 0.62158564814817 | 27.114 | 25.929 | 0.297 | 0.703 | 6.874 | 10.068 |
| 0.621597222222244 | 26.686 | 26.192 | 0.292 | 0.699 | 8.285 | 10.27 |
| 0.621608796296318 | 27.245 | 26.258 | 0.286 | 0.679 | 8.684 | 11.058 |
| 0.621620370370392 | 26.949 | 26.225 | 0.301 | 0.713 | 8.111 | 10.108 |
| 0.621631944444466 | 27.048 | 26.488 | 0.294 | 0.703 | 8.652 | 10.262 |
| 0.62164351851854 | 26.982 | 26.291 | 0.282 | 0.665 | 8.662 | 10.061 |
| 0.621655092592614 | 26.817 | 26.422 | 0.3 | 0.714 | 7.02 | 10.194 |
| 0.621666666666688 | 27.212 | 26.356 | 0.295 | 0.701 | 7.497 | 10.268 |
| 0.621678240740762 | 26.883 | 26.192 | 0.286 | 0.676 | 8.602 | 11.126 |
| 0.621689814814836 | 26.784 | 26.225 | 0.301 | 0.72 | 8.587 | 10.17 |
| 0.62170138888891 | 27.147 | 26.521 | 0.285 | 0.681 | 8.319 | 10.176 |
| 0.621712962962984 | 26.719 | 26.356 | 0.299 | 0.711 | 8.607 | 10.205 |
| 0.621724537037058 | 26.916 | 26.258 | 0.28 | 0.666 | 7.453 | 10.151 |
| 0.621736111111132 | 27.114 | 26.356 | 0.298 | 0.711 | 8.617 | 10.093 |
| 0.621747685185207 | 27.081 | 26.455 | 0.292 | 0.697 | 6.666 | 10.272 |
| 0.621759259259281 | 26.686 | 26.324 | 0.285 | 0.677 | 8.461 | 12.434 |
| 0.621770833333355 | 26.85 | 26.324 | 0.284 | 0.669 | 7.015 | 10.058 |
| 0.621782407407429 | 26.916 | 26.356 | 0.29 | 0.691 | 8.676 | 10.048 |
| 0.621793981481503 | 27.015 | 26.324 | 0.301 | 0.721 | 7.464 | 10.173 |
| 0.621805555555577 | 26.752 | 26.554 | 0.299 | 0.711 | 8.646 | 10.227 |
| 0.621817129629651 | 26.817 | 26.324 | 0.285 | 0.676 | 6.928 | 10.194 |
| 0.621828703703725 | 26.883 | 26.06 | 0.301 | 0.719 | 8.517 | 10.167 |
| 0.621840277777799 | 27.114 | 26.093 | 0.294 | 0.7 | 8.455 | 10.265 |
| 0.621851851851873 | 27.048 | 26.192 | 0.287 | 0.683 | 8.087 | 10.029 |
| 0.621863425925947 | 27.147 | 26.06 | 0.302 | 0.717 | 8.655 | 10.178 |
| 0.621875000000021 | 26.883 | 26.159 | 0.301 | 0.717 | 8.215 | 10.19 |
| 0.621886574074095 | 27.179 | 26.356 | 0.285 | 0.677 | 8.269 | 10.234 |
| 0.621898148148169 | 27.048 | 26.258 | 0.297 | 0.704 | 8.69 | 10.082 |
| 0.621909722222243 | 26.916 | 26.258 | 0.294 | 0.696 | 8.337 | 10.275 |
| 0.621921296296317 | 27.015 | 26.389 | 0.285 | 0.678 | 8.631 | 11.279 |
| 0.621932870370391 | 27.147 | 26.389 | 0.302 | 0.717 | 6.863 | 10.196 |
| 0.621944444444465 | 26.883 | 26.324 | 0.287 | 0.685 | 8.618 | 10.228 |
| 0.621956018518539 | 27.212 | 26.356 | 0.291 | 0.693 | 8.15 | 10.053 |
| 0.621967592592613 | 27.245 | 26.093 | 0.283 | 0.67 | 6.863 | 10.129 |
| 0.621979166666687 | 26.883 | 26.488 | 0.301 | 0.718 | 8.042 | 10.135 |
| 0.621990740740761 | 26.85 | 26.027 | 0.29 | 0.691 | 8.508 | 10.267 |
| 0.622002314814835 | 27.015 | 26.488 | 0.288 | 0.687 | 8.379 | 10.275 |
| 0.622013888888909 | 27.114 | 26.06 | 0.289 | 0.684 | 7.329 | 10.696 |
| 0.622025462962983 | 27.147 | 26.422 | 0.291 | 0.688 | 8.647 | 10.05 |
| 0.622037037037057 | 26.784 | 26.258 | 0.297 | 0.704 | 7.362 | 10.257 |
| 0.622048611111132 | 27.048 | 26.291 | 0.284 | 0.671 | 8.541 | 10.406 |
| 0.622060185185206 | 26.883 | 26.521 | 0.293 | 0.695 | 8.695 | 10.062 |
| 0.62207175925928 | 27.048 | 26.356 | 0.296 | 0.701 | 8.62 | 10.067 |
| 0.622083333333354 | 27.114 | 26.291 | 0.298 | 0.707 | 7.906 | 10.236 |
| 0.622094907407428 | 27.147 | 26.258 | 0.281 | 0.666 | 8.671 | 10.08 |
| 0.622106481481502 | 27.081 | 26.06 | 0.299 | 0.715 | 8.575 | 10.131 |
| 0.622118055555576 | 26.916 | 26.258 | 0.289 | 0.686 | 7.338 | 10.249 |
| 0.62212962962965 | 27.41 | 26.356 | 0.289 | 0.683 | 8.692 | 10.04 |
| 0.622141203703724 | 27.048 | 26.258 | 0.3 | 0.712 | 7.713 | 10.213 |
| 0.622152777777798 | 26.883 | 26.225 | 0.291 | 0.693 | 8.654 | 10.041 |
| 0.622164351851872 | 26.85 | 26.225 | 0.299 | 0.712 | 7.364 | 10.212 |
| 0.622175925925946 | 27.081 | 26.488 | 0.287 | 0.681 | 8.704 | 10.238 |
| 0.62218750000002 | 26.982 | 25.929 | 0.286 | 0.683 | 7.666 | 10.15 |
| 0.622199074074094 | 27.212 | 26.554 | 0.285 | 0.677 | 8.684 | 10.015 |
| 0.622210648148168 | 26.949 | 26.554 | 0.298 | 0.713 | 6.97 | 10.217 |
| 0.622222222222242 | 26.949 | 25.863 | 0.287 | 0.682 | 8.36 | 10.099 |
| 0.622233796296316 | 27.147 | 26.356 | 0.287 | 0.678 | 8.47 | 10.025 |
| 0.62224537037039 | 26.949 | 26.422 | 0.298 | 0.703 | 8.324 | 10.061 |
| 0.622256944444464 | 27.015 | 26.356 | 0.284 | 0.669 | 8.749 | 10.101 |
| 0.622268518518538 | 27.081 | 26.093 | 0.299 | 0.711 | 8.678 | 10.099 |
| 0.622280092592612 | 26.982 | 26.62 | 0.292 | 0.689 | 8.598 | 10.038 |
| 0.622291666666686 | 26.982 | 26.258 | 0.301 | 0.717 | 7.83 | 10.186 |
| 0.62230324074076 | 27.015 | 26.225 | 0.292 | 0.699 | 8.326 | 10.266 |
| 0.622314814814834 | 27.081 | 26.389 | 0.282 | 0.667 | 8.649 | 10.071 |
| 0.622326388888908 | 27.048 | 26.389 | 0.291 | 0.693 | 7.828 | 10.037 |
| 0.622337962962982 | 26.883 | 26.455 | 0.285 | 0.678 | 7.019 | 10.025 |
| 0.622349537037057 | 27.147 | 26.554 | 0.301 | 0.719 | 8.583 | 10.126 |
| 0.622361111111131 | 27.147 | 26.422 | 0.301 | 0.714 | 7.218 | 10.179 |
| 0.622372685185205 | 26.883 | 26.356 | 0.3 | 0.716 | 8.666 | 10.229 |
| 0.622384259259279 | 26.982 | 26.356 | 0.295 | 0.699 | 7.71 | 10.271 |
| 0.622395833333353 | 27.048 | 26.62 | 0.282 | 0.665 | 8.572 | 10.052 |
| 0.622407407407427 | 27.147 | 26.455 | 0.297 | 0.708 | 8.625 | 10.255 |
| 0.622418981481501 | 27.147 | 26.06 | 0.289 | 0.683 | 7.119 | 10.091 |
| 0.622430555555575 | 27.147 | 26.521 | 0.294 | 0.698 | 8.688 | 10.065 |
| 0.622442129629649 | 27.048 | 26.422 | 0.301 | 0.714 | 7.875 | 10.123 |
| 0.622453703703723 | 27.245 | 26.752 | 0.295 | 0.701 | 8.424 | 10.263 |
| 0.622465277777797 | 27.048 | 26.422 | 0.29 | 0.686 | 8.43 | 10.286 |
| 0.622476851851871 | 27.311 | 26.719 | 0.289 | 0.69 | 8.698 | 10.251 |
| 0.622488425925945 | 27.048 | 26.554 | 0.285 | 0.674 | 8.655 | 10.148 |
| 0.622500000000019 | 27.015 | 26.324 | 0.296 | 0.699 | 7.386 | 10.081 |
| 0.622511574074093 | 27.147 | 26.356 | 0.297 | 0.704 | 8.628 | 10.253 |
| 0.622523148148167 | 27.015 | 26.587 | 0.288 | 0.684 | 6.996 | 10.263 |
| 0.622534722222241 | 26.817 | 26.291 | 0.302 | 0.717 | 8.674 | 10.133 |
| 0.622546296296315 | 27.147 | 26.422 | 0.299 | 0.71 | 7.5 | 10.212 |
| 0.622557870370389 | 27.081 | 26.126 | 0.291 | 0.697 | 8.696 | 10.297 |
| 0.622569444444463 | 27.179 | 26.488 | 0.286 | 0.682 | 8.564 | 10.033 |
| 0.622581018518537 | 27.147 | 26.752 | 0.302 | 0.716 | 7.519 | 10.189 |
| 0.622592592592611 | 26.85 | 26.653 | 0.291 | 0.691 | 8.526 | 10.297 |
| 0.622604166666685 | 27.048 | 26.455 | 0.289 | 0.685 | 6.934 | 10.228 |
| 0.622615740740759 | 27.245 | 26.422 | 0.286 | 0.676 | 8.628 | 10.207 |
| 0.622627314814833 | 27.278 | 26.587 | 0.297 | 0.706 | 8.694 | 10.25 |
| 0.622638888888908 | 27.179 | 26.258 | 0.285 | 0.674 | 7.446 | 12.198 |
| 0.622650462962982 | 26.949 | 26.752 | 0.3 | 0.717 | 8.666 | 10.142 |
| 0.622662037037056 | 26.916 | 26.422 | 0.299 | 0.711 | 7.775 | 10.26 |
| 0.62267361111113 | 27.443 | 26.752 | 0.291 | 0.693 | 8.074 | 10.265 |
| 0.622685185185204 | 26.916 | 26.356 | 0.284 | 0.679 | 8.646 | 10.221 |
| 0.622696759259278 | 27.278 | 26.521 | 0.287 | 0.682 | 8.183 | 10.038 |
| 0.622708333333352 | 27.015 | 26.521 | 0.297 | 0.706 | 7.105 | 10.081 |
| 0.622719907407426 | 27.015 | 27.015 | 0.3 | 0.713 | 8.645 | 10.252 |
| 0.6227314814815 | 26.62 | 26.356 | 0.287 | 0.681 | 6.821 | 10.133 |
| 0.622743055555574 | 27.081 | 26.455 | 0.298 | 0.712 | 6.956 | 10.132 |
| 0.622754629629648 | 27.147 | 26.258 | 0.285 | 0.673 | 8.591 | 10.173 |
| 0.622766203703722 | 27.245 | 26.06 | 0.301 | 0.718 | 8.056 | 10.205 |
| 0.622777777777796 | 26.916 | 26.62 | 0.283 | 0.672 | 8.584 | 10.891 |
| 0.62278935185187 | 27.344 | 26.686 | 0.301 | 0.717 | 8.67 | 10.182 |
| 0.622800925925944 | 27.245 | 26.752 | 0.292 | 0.695 | 7.732 | 10.293 |
| 0.622812500000018 | 27.048 | 26.455 | 0.298 | 0.71 | 8.662 | 10.085 |
| 0.622824074074092 | 27.311 | 26.62 | 0.3 | 0.713 | 7.555 | 10.2 |
| 0.622835648148166 | 27.245 | 26.587 | 0.29 | 0.689 | 8.307 | 10.278 |
| 0.62284722222224 | 27.081 | 26.752 | 0.29 | 0.687 | 8.519 | 10.26 |
| 0.622858796296314 | 27.081 | 26.554 | 0.291 | 0.686 | 7.478 | 10.044 |
| 0.622870370370388 | 27.278 | 26.389 | 0.294 | 0.704 | 7.992 | 10.288 |
| 0.622881944444462 | 27.311 | 26.653 | 0.297 | 0.708 | 7.524 | 10.079 |
| 0.622893518518536 | 26.817 | 26.653 | 0.296 | 0.708 | 8.698 | 10.258 |
| 0.62290509259261 | 27.147 | 26.554 | 0.296 | 0.699 | 7.28 | 10.066 |
| 0.622916666666684 | 27.081 | 26.554 | 0.295 | 0.705 | 8.583 | 10.287 |
| 0.622928240740758 | 27.015 | 26.258 | 0.287 | 0.684 | 6.753 | 11.033 |
| 0.622939814814833 | 27.212 | 26.554 | 0.298 | 0.713 | 8.707 | 10.193 |
| 0.622951388888907 | 27.377 | 26.422 | 0.29 | 0.685 | 7.221 | 10.267 |
| 0.622962962962981 | 27.443 | 26.587 | 0.288 | 0.687 | 8.697 | 10.084 |
| 0.622974537037055 | 27.212 | 26.324 | 0.29 | 0.689 | 8.018 | 10.046 |
| 0.622986111111129 | 27.278 | 26.62 | 0.301 | 0.72 | 8.658 | 10.132 |
| 0.622997685185203 | 27.048 | 26.554 | 0.299 | 0.716 | 8.266 | 10.126 |
| 0.623009259259277 | 27.015 | 26.521 | 0.292 | 0.697 | 8.637 | 10.3 |
| 0.623020833333351 | 27.245 | 26.324 | 0.301 | 0.713 | 8.299 | 10.139 |
| 0.623032407407425 | 27.344 | 26.422 | 0.283 | 0.668 | 8.236 | 10.199 |
| 0.623043981481499 | 27.147 | 26.653 | 0.298 | 0.71 | 6.658 | 10.09 |
| 0.623055555555573 | 27.212 | 26.62 | 0.281 | 0.666 | 8.59 | 11.136 |
| 0.623067129629647 | 27.179 | 26.653 | 0.293 | 0.701 | 6.889 | 10.283 |
| 0.623078703703721 | 27.443 | 26.686 | 0.287 | 0.685 | 8.705 | 10.197 |
| 0.623090277777795 | 27.278 | 26.817 | 0.285 | 0.68 | 6.821 | 10.186 |
| 0.623101851851869 | 27.081 | 26.521 | 0.298 | 0.706 | 8.639 | 10.086 |
| 0.623113425925943 | 27.476 | 26.686 | 0.3 | 0.715 | 8.02 | 10.214 |
| 0.623125000000017 | 27.344 | 26.784 | 0.285 | 0.674 | 8.634 | 10.223 |
| 0.623136574074091 | 27.245 | 26.422 | 0.294 | 0.702 | 7.849 | 10.057 |
| 0.623148148148165 | 27.179 | 26.356 | 0.291 | 0.69 | 8.68 | 10.269 |
| 0.623159722222239 | 27.212 | 26.784 | 0.288 | 0.68 | 7.509 | 10.04 |
| 0.623171296296313 | 27.245 | 26.653 | 0.288 | 0.681 | 8.691 | 10.288 |
| 0.623182870370387 | 27.311 | 26.587 | 0.293 | 0.695 | 8.497 | 10.047 |
| 0.623194444444461 | 27.607 | 26.554 | 0.297 | 0.713 | 8.229 | 10.221 |
| 0.623206018518535 | 27.377 | 26.784 | 0.298 | 0.711 | 8.984 | 10.119 |
| 0.623217592592609 | 27.377 | 26.686 | 0.295 | 0.7 | 7.575 | 10.284 |
| 0.623229166666683 | 27.212 | 26.488 | 0.293 | 0.699 | 9.096 | 10.272 |
| 0.623240740740758 | 27.179 | 26.752 | 0.292 | 0.696 | 7.641 | 10.067 |
| 0.623252314814832 | 27.278 | 26.686 | 0.299 | 0.709 | 7.114 | 10.255 |
| 0.623263888888906 | 27.344 | 26.784 | 0.286 | 0.681 | 8.117 | 10.116 |
| 0.62327546296298 | 27.081 | 26.455 | 0.292 | 0.695 | 9.123 | 10.05 |
| 0.623287037037054 | 27.476 | 26.719 | 0.292 | 0.692 | 9.108 | 10.04 |
| 0.623298611111128 | 27.245 | 26.587 | 0.295 | 0.703 | 9.052 | 10.067 |
| 0.623310185185202 | 27.311 | 26.389 | 0.302 | 0.719 | 8.269 | 10.143 |
| 0.623321759259276 | 27.114 | 26.784 | 0.301 | 0.717 | 9.054 | 10.205 |
| 0.62333333333335 | 27.443 | 26.752 | 0.288 | 0.689 | 8.869 | 10.287 |
| 0.623344907407424 | 27.574 | 26.817 | 0.294 | 0.7 | 8.468 | 10.063 |
| 0.623356481481498 | 27.048 | 26.62 | 0.297 | 0.707 | 8.811 | 10.244 |
| 0.623368055555572 | 27.311 | 26.422 | 0.285 | 0.672 | 8.485 | 10.147 |
| 0.623379629629646 | 27.542 | 26.521 | 0.302 | 0.716 | 8.897 | 10.188 |
| 0.62339120370372 | 27.311 | 26.455 | 0.298 | 0.711 | 7.743 | 10.237 |
| 0.623402777777794 | 27.607 | 26.488 | 0.287 | 0.681 | 9.035 | 10.279 |
| 0.623414351851868 | 27.542 | 26.686 | 0.3 | 0.71 | 9.074 | 10.092 |
| 0.623425925925942 | 27.476 | 26.291 | 0.3 | 0.711 | 7.503 | 10.195 |
| 0.623437500000016 | 27.311 | 26.488 | 0.281 | 0.667 | 8.626 | 10.06 |
| 0.62344907407409 | 27.344 | 26.752 | 0.3 | 0.716 | 9.098 | 10.208 |
| 0.623460648148164 | 27.245 | 26.784 | 0.29 | 0.693 | 8.942 | 10.268 |
| 0.623472222222238 | 27.377 | 26.422 | 0.283 | 0.673 | 9.072 | 10.045 |
| 0.623483796296312 | 27.443 | 26.916 | 0.29 | 0.691 | 8.712 | 10.294 |
| 0.623495370370386 | 27.245 | 26.752 | 0.287 | 0.685 | 7.554 | 10.204 |
| 0.62350694444446 | 27.344 | 26.817 | 0.291 | 0.694 | 8.872 | 10.05 |
| 0.623518518518534 | 27.607 | 26.719 | 0.301 | 0.714 | 9.087 | 10.23 |
| 0.623530092592608 | 27.147 | 26.587 | 0.3 | 0.715 | 9.127 | 10.238 |
| 0.623541666666683 | 27.212 | 26.883 | 0.287 | 0.677 | 9.069 | 10.245 |
| 0.623553240740757 | 27.311 | 26.719 | 0.287 | 0.677 | 7.683 | 10.027 |
| 0.623564814814831 | 27.245 | 26.85 | 0.298 | 0.704 | 7.41 | 10.071 |
| 0.623576388888905 | 27.344 | 26.817 | 0.301 | 0.714 | 9.079 | 10.099 |
| 0.623587962962979 | 27.344 | 26.587 | 0.302 | 0.715 | 8.098 | 10.19 |
| 0.623599537037053 | 27.509 | 26.817 | 0.285 | 0.679 | 9.077 | 10.223 |
| 0.623611111111127 | 27.212 | 26.817 | 0.3 | 0.716 | 7.694 | 10.099 |
| 0.623622685185201 | 27.41 | 26.85 | 0.289 | 0.685 | 9.085 | 10.259 |
| 0.623634259259275 | 27.311 | 26.784 | 0.284 | 0.671 | 9.018 | 10.046 |
| 0.623645833333349 | 27.542 | 26.488 | 0.301 | 0.714 | 7.135 | 10.154 |
| 0.623657407407423 | 27.805 | 27.015 | 0.292 | 0.696 | 9.093 | 10.273 |
| 0.623668981481497 | 27.509 | 26.817 | 0.285 | 0.674 | 9.093 | 10.183 |
| 0.623680555555571 | 27.344 | 26.883 | 0.293 | 0.693 | 8.43 | 10.039 |
| 0.623692129629645 | 27.443 | 26.521 | 0.289 | 0.684 | 9.07 | 10.032 |
| 0.623703703703719 | 27.245 | 26.719 | 0.291 | 0.685 | 8.851 | 10.021 |
| 0.623715277777793 | 27.64 | 26.455 | 0.299 | 0.712 | 7.368 | 10.198 |
| 0.623726851851867 | 27.344 | 26.62 | 0.294 | 0.698 | 9.109 | 10.29 |
| 0.623738425925941 | 27.476 | 26.62 | 0.283 | 0.668 | 8.237 | 10.053 |
| 0.623750000000015 | 27.706 | 26.455 | 0.298 | 0.712 | 7.112 | 10.223 |
| 0.623761574074089 | 27.41 | 26.719 | 0.291 | 0.694 | 9.064 | 10.288 |
| 0.623773148148163 | 27.278 | 26.686 | 0.282 | 0.672 | 8.426 | 10.112 |
| 0.623784722222237 | 27.476 | 26.817 | 0.295 | 0.705 | 7.101 | 10.063 |
| 0.623796296296311 | 27.41 | 26.784 | 0.289 | 0.689 | 9.104 | 10.29 |
| 0.623807870370385 | 27.607 | 26.653 | 0.297 | 0.704 | 9.011 | 10.246 |
| 0.623819444444459 | 27.443 | 26.949 | 0.291 | 0.693 | 8.748 | 10.031 |
| 0.623831018518534 | 27.673 | 26.422 | 0.301 | 0.712 | 7 | 10.13 |
| 0.623842592592608 | 27.41 | 26.653 | 0.292 | 0.698 | 8.609 | 10.288 |
| 0.623854166666682 | 27.574 | 26.587 | 0.284 | 0.671 | 8.548 | 10.097 |
| 0.623865740740756 | 27.607 | 26.85 | 0.292 | 0.699 | 8.849 | 10.264 |
| 0.62387731481483 | 27.245 | 26.521 | 0.283 | 0.671 | 9.065 | 11.476 |
| 0.623888888888904 | 27.542 | 26.85 | 0.285 | 0.676 | 9.048 | 10.023 |
| 0.623900462962978 | 27.64 | 26.686 | 0.283 | 0.673 | 9.076 | 12.559 |
| 0.623912037037052 | 27.476 | 26.949 | 0.287 | 0.683 | 8.536 | 10.271 |
| 0.623923611111126 | 27.607 | 26.719 | 0.294 | 0.694 | 9.039 | 10.033 |
| 0.6239351851852 | 27.772 | 26.686 | 0.3 | 0.712 | 7.188 | 10.115 |
| 0.623946759259274 | 27.245 | 26.587 | 0.299 | 0.711 | 9.091 | 10.236 |
| 0.623958333333348 | 27.574 | 26.752 | 0.286 | 0.682 | 8.744 | 10.196 |
| 0.623969907407422 | 27.245 | 26.62 | 0.288 | 0.68 | 9.023 | 10.023 |
| 0.623981481481496 | 27.574 | 26.752 | 0.294 | 0.697 | 8.304 | 10.293 |
| 0.62399305555557 | 27.838 | 26.587 | 0.285 | 0.679 | 8.881 | 10.023 |
| 0.624004629629644 | 27.443 | 26.62 | 0.301 | 0.719 | 9.091 | 10.166 |
| 0.624016203703718 | 27.509 | 26.587 | 0.295 | 0.704 | 8.604 | 10.271 |
| 0.624027777777792 | 27.212 | 26.587 | 0.286 | 0.678 | 7.099 | 10.139 |
| 0.624039351851866 | 27.509 | 26.719 | 0.299 | 0.71 | 9.037 | 10.153 |
| 0.62405092592594 | 27.509 | 26.62 | 0.296 | 0.708 | 8.861 | 10.27 |
| 0.624062500000014 | 27.41 | 26.587 | 0.285 | 0.672 | 7.722 | 10.024 |
| 0.624074074074088 | 28.035 | 26.62 | 0.298 | 0.705 | 9.069 | 10.224 |
| 0.624085648148162 | 27.41 | 26.324 | 0.285 | 0.674 | 9.006 | 12.478 |
| 0.624097222222236 | 27.41 | 26.719 | 0.294 | 0.701 | 9.041 | 10.055 |
| 0.62410879629631 | 27.542 | 26.784 | 0.293 | 0.7 | 8.703 | 10.27 |
| 0.624120370370384 | 27.311 | 26.784 | 0.283 | 0.67 | 8.189 | 11.465 |
| 0.624131944444459 | 27.542 | 26.62 | 0.304 | 0.719 | 8.531 | 10.182 |
| 0.624143518518533 | 27.64 | 26.883 | 0.3 | 0.713 | 9.013 | 10.206 |
| 0.624155092592607 | 27.476 | 26.916 | 0.29 | 0.685 | 8.275 | 10.274 |
| 0.624166666666681 | 27.377 | 27.212 | 0.3 | 0.716 | 9.082 | 10.13 |
| 0.624178240740755 | 27.509 | 26.85 | 0.298 | 0.713 | 8.55 | 10.202 |
| 0.624189814814829 | 27.509 | 26.784 | 0.285 | 0.674 | 7.763 | 12.575 |
| 0.624201388888903 | 27.377 | 26.752 | 0.298 | 0.709 | 9.137 | 10.09 |
| 0.624212962962977 | 27.509 | 27.114 | 0.301 | 0.714 | 9.12 | 10.188 |
| 0.624224537037051 | 27.509 | 26.784 | 0.296 | 0.706 | 8.733 | 10.271 |
| 0.624236111111125 | 27.805 | 26.752 | 0.287 | 0.678 | 7.774 | 10.138 |
| 0.624247685185199 | 27.871 | 26.719 | 0.288 | 0.679 | 7.179 | 10.181 |
| 0.624259259259273 | 27.805 | 26.752 | 0.284 | 0.671 | 9.141 | 10.052 |
| 0.624270833333347 | 27.542 | 26.587 | 0.299 | 0.712 | 8.357 | 10.105 |
| 0.624282407407421 | 27.673 | 26.653 | 0.294 | 0.697 | 8.914 | 10.05 |
| 0.624293981481495 | 27.607 | 27.048 | 0.298 | 0.706 | 8.198 | 10.219 |
| 0.624305555555569 | 27.542 | 26.488 | 0.297 | 0.711 | 9.038 | 10.252 |
| 0.624317129629643 | 27.476 | 26.817 | 0.372 | 0.83 | 8.753 | 10.798 |
| 0.624328703703717 | 27.311 | 27.179 | 0.333 | 0.735 | 8.883 | 10.809 |
| 0.624340277777791 | 27.542 | 26.587 | 0.348 | 0.775 | 9.092 | 10.855 |
| 0.624351851851865 | 27.476 | 26.883 | 0.332 | 0.738 | 9.17 | 10.826 |
| 0.624363425925939 | 27.344 | 26.752 | 0.333 | 0.744 | 8.307 | 10.928 |
| 0.624375000000013 | 27.574 | 27.114 | 0.34 | 0.755 | 9.048 | 10.965 |
| 0.624386574074087 | 27.706 | 27.179 | 0.344 | 0.763 | 7.524 | 10.812 |
| 0.624398148148161 | 27.673 | 27.179 | 0.345 | 0.767 | 9.109 | 10.972 |
| 0.624409722222235 | 27.574 | 26.949 | 0.331 | 0.734 | 9.001 | 10.788 |
| 0.624421296296309 | 27.542 | 26.982 | 0.346 | 0.767 | 7.282 | 10.818 |
| 0.624432870370384 | 27.904 | 27.114 | 0.33 | 0.73 | 9.09 | 10.77 |
| 0.624444444444458 | 27.871 | 26.85 | 0.35 | 0.782 | 9.02 | 10.885 |
| 0.624456018518532 | 27.574 | 26.686 | 0.336 | 0.749 | 8.945 | 10.949 |
| 0.624467592592606 | 27.542 | 26.883 | 0.344 | 0.762 | 7.064 | 10.804 |
| 0.62447916666668 | 27.706 | 27.015 | 0.336 | 0.743 | 8.508 | 10.903 |
| 0.624490740740754 | 27.706 | 27.048 | 0.342 | 0.757 | 9.075 | 10.795 |
| 0.624502314814828 | 27.41 | 26.916 | 0.343 | 0.767 | 8.026 | 10.951 |
| 0.624513888888902 | 27.344 | 27.048 | 0.333 | 0.735 | 7.032 | 10.753 |
| 0.624525462962976 | 27.607 | 27.081 | 0.345 | 0.767 | 9.059 | 10.965 |
| 0.62453703703705 | 27.574 | 26.982 | 0.335 | 0.745 | 8.216 | 10.752 |
| 0.624548611111124 | 27.278 | 26.817 | 0.34 | 0.756 | 8.591 | 10.967 |
| 0.624560185185198 | 27.542 | 27.081 | 0.345 | 0.765 | 9.095 | 10.829 |
| 0.624571759259272 | 27.739 | 27.048 | 0.331 | 0.729 | 9.045 | 11.795 |
| 0.624583333333346 | 27.344 | 26.883 | 0.339 | 0.751 | 8.725 | 10.981 |
| 0.62459490740742 | 27.41 | 27.212 | 0.337 | 0.752 | 9.031 | 10.772 |
| 0.624606481481494 | 28.068 | 27.311 | 0.344 | 0.77 | 6.948 | 10.948 |
| 0.624618055555568 | 27.805 | 26.949 | 0.335 | 0.746 | 8.741 | 10.913 |
| 0.624629629629642 | 27.443 | 26.752 | 0.348 | 0.772 | 9.062 | 10.884 |
| 0.624641203703716 | 27.673 | 26.85 | 0.337 | 0.745 | 8.892 | 10.911 |
| 0.62465277777779 | 27.64 | 27.015 | 0.347 | 0.77 | 8.821 | 10.842 |
| 0.624664351851864 | 27.574 | 27.377 | 0.343 | 0.761 | 8.814 | 10.982 |
| 0.624675925925938 | 27.64 | 26.916 | 0.338 | 0.752 | 7.735 | 10.943 |
| 0.624687500000012 | 27.607 | 27.212 | 0.333 | 0.74 | 8.541 | 10.77 |
| 0.624699074074086 | 27.311 | 27.048 | 0.348 | 0.771 | 8.316 | 10.937 |
| 0.62471064814816 | 27.838 | 27.278 | 0.341 | 0.762 | 9.07 | 10.97 |
| 0.624722222222235 | 27.476 | 26.719 | 0.341 | 0.756 | 9.058 | 10.799 |
| 0.624733796296309 | 27.476 | 27.081 | 0.343 | 0.767 | 9.111 | 10.986 |
| 0.624745370370383 | 27.673 | 26.817 | 0.331 | 0.734 | 9.135 | 10.795 |
| 0.624756944444457 | 27.673 | 27.081 | 0.344 | 0.767 | 9.102 | 10.951 |
| 0.624768518518531 | 27.805 | 26.85 | 0.332 | 0.738 | 8.843 | 11.175 |
| 0.624780092592605 | 27.542 | 27.081 | 0.348 | 0.779 | 8.69 | 10.918 |
| 0.624791666666679 | 27.838 | 27.311 | 0.348 | 0.772 | 7.836 | 10.948 |
| 0.624803240740753 | 27.97 | 27.245 | 0.347 | 0.772 | 7.686 | 10.957 |
| 0.624814814814827 | 27.706 | 27.179 | 0.332 | 0.734 | 7.263 | 10.798 |
| 0.624826388888901 | 27.64 | 27.245 | 0.346 | 0.768 | 9.091 | 10.928 |
| 0.624837962962975 | 27.607 | 27.278 | 0.335 | 0.74 | 9.097 | 10.775 |
| 0.624849537037049 | 27.772 | 27.278 | 0.347 | 0.775 | 9.086 | 10.945 |
| 0.624861111111123 | 27.509 | 26.784 | 0.335 | 0.745 | 9.077 | 10.875 |
| 0.624872685185197 | 27.97 | 26.883 | 0.346 | 0.767 | 9.084 | 10.874 |
| 0.624884259259271 | 27.871 | 27.41 | 0.335 | 0.743 | 9.061 | 10.815 |
| 0.624895833333345 | 27.574 | 27.015 | 0.336 | 0.747 | 8.999 | 10.976 |
| 0.624907407407419 | 27.772 | 27.278 | 0.338 | 0.751 | 9.303 | 10.928 |
| 0.624918981481493 | 27.64 | 27.114 | 0.332 | 0.735 | 9.051 | 10.78 |
| 0.624930555555567 | 27.904 | 27.015 | 0.348 | 0.774 | 9.085 | 10.851 |
| 0.624942129629641 | 27.706 | 27.114 | 0.334 | 0.742 | 8.5 | 13.231 |
| 0.624953703703715 | 27.706 | 27.015 | 0.343 | 0.763 | 8.359 | 10.957 |
| 0.624965277777789 | 28.002 | 26.982 | 0.331 | 0.731 | 8.977 | 10.894 |
| 0.624976851851863 | 27.97 | 27.048 | 0.343 | 0.763 | 9.1 | 10.968 |
| 0.624988425925937 | 27.97 | 26.883 | 0.333 | 0.741 | 9.017 | 10.759 |
| 0.625000000000011 | 27.838 | 27.245 | 0.346 | 0.773 | 8.368 | 10.921 |
| 0.625011574074085 | 27.41 | 27.179 | 0.335 | 0.741 | 9.026 | 13.353 |
| 0.62502314814816 | 27.805 | 26.949 | 0.35 | 0.776 | 8.968 | 10.901 |
| 0.625034722222234 | 27.64 | 27.41 | 0.336 | 0.749 | 8.96 | 10.928 |
| 0.625046296296308 | 27.673 | 27.147 | 0.343 | 0.763 | 9.057 | 10.805 |
| 0.625057870370382 | 27.739 | 27.212 | 0.348 | 0.778 | 8.972 | 10.929 |
| 0.625069444444456 | 27.871 | 27.245 | 0.336 | 0.747 | 8.877 | 10.902 |
| 0.62508101851853 | 27.871 | 27.147 | 0.348 | 0.772 | 9.11 | 10.899 |
| 0.625092592592604 | 27.904 | 27.081 | 0.337 | 0.745 | 9.076 | 10.896 |
| 0.625104166666678 | 27.871 | 26.982 | 0.332 | 0.733 | 9.111 | 10.815 |
| 0.625115740740752 | 27.706 | 26.883 | 0.334 | 0.743 | 8.347 | 10.774 |
| 0.625127314814826 | 27.904 | 27.081 | 0.344 | 0.767 | 8.519 | 10.969 |
| 0.6251388888889 | 27.772 | 27.212 | 0.334 | 0.743 | 9.127 | 12.579 |
| 0.625150462962974 | 27.64 | 27.048 | 0.348 | 0.772 | 9.032 | 10.872 |
| 0.625162037037048 | 27.443 | 27.344 | 0.34 | 0.757 | 9.127 | 10.981 |
| 0.625173611111122 | 28.134 | 26.982 | 0.332 | 0.737 | 9.126 | 10.814 |
| 0.625185185185196 | 27.838 | 27.443 | 0.345 | 0.766 | 8.742 | 10.817 |
| 0.62519675925927 | 27.706 | 27.41 | 0.348 | 0.775 | 8.798 | 10.944 |
| 0.625208333333344 | 27.805 | 26.784 | 0.336 | 0.744 | 9.053 | 10.926 |
| 0.625219907407418 | 27.772 | 27.212 | 0.335 | 0.744 | 8.816 | 10.766 |
| 0.625231481481492 | 27.574 | 26.982 | 0.351 | 0.782 | 7.023 | 10.874 |
| 0.625243055555566 | 28.035 | 27.147 | 0.347 | 0.772 | 6.942 | 10.923 |
| 0.62525462962964 | 27.904 | 27.147 | 0.343 | 0.763 | 8.63 | 10.979 |
| 0.625266203703714 | 28.035 | 26.85 | 0.338 | 0.746 | 8.907 | 10.813 |
| 0.625277777777788 | 27.542 | 27.015 | 0.346 | 0.772 | 9.012 | 10.839 |
| 0.625289351851862 | 28.167 | 26.916 | 0.339 | 0.753 | 8.404 | 10.988 |
| 0.625300925925936 | 27.904 | 27.212 | 0.335 | 0.743 | 9.132 | 10.769 |
| 0.62531250000001 | 27.607 | 27.114 | 0.345 | 0.772 | 9.099 | 10.933 |
| 0.625324074074085 | 27.97 | 27.179 | 0.332 | 0.737 | 9.137 | 12.455 |
| 0.625335648148159 | 27.937 | 27.147 | 0.335 | 0.742 | 7.598 | 10.908 |
| 0.625347222222233 | 28.002 | 27.278 | 0.343 | 0.765 | 9.05 | 10.795 |
| 0.625358796296307 | 27.64 | 27.311 | 0.338 | 0.751 | 9.044 | 10.971 |
| 0.625370370370381 | 27.772 | 27.41 | 0.337 | 0.75 | 8.565 | 10.965 |
| 0.625381944444455 | 27.904 | 27.311 | 0.337 | 0.749 | 9.075 | 10.968 |
| 0.625393518518529 | 28.134 | 27.081 | 0.344 | 0.761 | 8.998 | 10.956 |
| 0.625405092592603 | 27.607 | 27.048 | 0.345 | 0.771 | 8.062 | 10.863 |
| 0.625416666666677 | 27.838 | 27.212 | 0.335 | 0.744 | 7.278 | 10.834 |
| 0.625428240740751 | 27.904 | 26.883 | 0.341 | 0.759 | 8.723 | 10.782 |
| 0.625439814814825 | 27.673 | 27.147 | 0.342 | 0.759 | 9.029 | 10.967 |
| 0.625451388888899 | 28.035 | 27.443 | 0.337 | 0.747 | 7.871 | 10.776 |
| 0.625462962962973 | 27.706 | 27.245 | 0.346 | 0.769 | 7.335 | 10.964 |
| 0.625474537037047 | 27.871 | 27.048 | 0.333 | 0.736 | 9.08 | 10.778 |
| 0.625486111111121 | 27.97 | 27.015 | 0.334 | 0.746 | 8.822 | 10.863 |
| 0.625497685185195 | 28.101 | 27.147 | 0.348 | 0.774 | 8.035 | 10.875 |
| 0.625509259259269 | 27.904 | 26.949 | 0.333 | 0.743 | 9.061 | 10.883 |
| 0.625520833333343 | 27.64 | 27.114 | 0.343 | 0.764 | 8.826 | 10.805 |
| 0.625532407407417 | 27.871 | 27.015 | 0.337 | 0.744 | 7.761 | 10.923 |
| 0.625543981481491 | 27.904 | 27.311 | 0.345 | 0.772 | 6.978 | 10.845 |
| 0.625555555555565 | 27.706 | 27.179 | 0.335 | 0.747 | 8.526 | 10.774 |
| 0.625567129629639 | 27.772 | 27.081 | 0.343 | 0.76 | 9.118 | 10.98 |
| 0.625578703703713 | 27.772 | 27.377 | 0.343 | 0.76 | 8.093 | 10.975 |
| 0.625590277777787 | 27.904 | 27.015 | 0.346 | 0.773 | 7.221 | 10.817 |
| 0.625601851851861 | 27.607 | 27.212 | 0.34 | 0.756 | 7.517 | 10.964 |
| 0.625613425925935 | 27.97 | 27.114 | 0.336 | 0.748 | 6.99 | 10.767 |
| 0.62562500000001 | 27.805 | 27.607 | 0.343 | 0.764 | 8.453 | 10.985 |
| 0.625636574074084 | 27.871 | 27.476 | 0.338 | 0.75 | 7.288 | 10.823 |
| 0.625648148148158 | 28.002 | 27.278 | 0.345 | 0.766 | 7.996 | 10.839 |
| 0.625659722222232 | 28.002 | 27.41 | 0.344 | 0.77 | 7.661 | 10.971 |
| 0.625671296296306 | 28.035 | 27.114 | 0.336 | 0.744 | 6.987 | 10.846 |
| 0.62568287037038 | 27.904 | 27.114 | 0.337 | 0.745 | 9.024 | 10.771 |
| 0.625694444444454 | 28.035 | 27.114 | 0.337 | 0.746 | 7.194 | 10.88 |
| 0.625706018518528 | 28.002 | 26.982 | 0.332 | 0.733 | 6.978 | 10.792 |
| 0.625717592592602 | 27.805 | 27.443 | 0.346 | 0.771 | 9.039 | 10.849 |
| 0.625729166666676 | 27.739 | 27.245 | 0.338 | 0.748 | 9.091 | 10.954 |
| 0.62574074074075 | 27.838 | 27.377 | 0.341 | 0.754 | 8.926 | 10.805 |
| 0.625752314814824 | 27.97 | 27.147 | 0.338 | 0.75 | 7.323 | 10.963 |
| 0.625763888888898 | 27.97 | 27.081 | 0.344 | 0.763 | 9.101 | 10.821 |
| 0.625775462962972 | 28.068 | 27.344 | 0.339 | 0.754 | 8.003 | 10.77 |
| 0.625787037037046 | 27.871 | 27.245 | 0.333 | 0.735 | 8.184 | 12.668 |
| 0.62579861111112 | 27.772 | 26.916 | 0.348 | 0.778 | 9.076 | 10.888 |
| 0.625810185185194 | 27.937 | 27.443 | 0.339 | 0.757 | 9.08 | 10.979 |
| 0.625821759259268 | 28.002 | 26.982 | 0.342 | 0.758 | 9.033 | 10.77 |
| 0.625833333333342 | 27.739 | 27.147 | 0.34 | 0.761 | 8.245 | 10.961 |
| 0.625844907407416 | 27.937 | 27.212 | 0.346 | 0.769 | 8.352 | 10.831 |
| 0.62585648148149 | 27.739 | 27.311 | 0.336 | 0.743 | 9.109 | 10.894 |
| 0.625868055555564 | 28.101 | 27.048 | 0.347 | 0.774 | 8.678 | 10.839 |
| 0.625879629629638 | 27.805 | 27.41 | 0.339 | 0.754 | 9.132 | 10.958 |
| 0.625891203703712 | 27.838 | 26.982 | 0.346 | 0.767 | 9.013 | 10.869 |
| 0.625902777777786 | 27.772 | 27.443 | 0.335 | 0.747 | 9.082 | 10.945 |
| 0.625914351851861 | 27.805 | 27.081 | 0.348 | 0.773 | 9.097 | 10.874 |
| 0.625925925925935 | 28.002 | 27.377 | 0.345 | 0.768 | 9.062 | 10.939 |
| 0.625937500000009 | 27.871 | 27.278 | 0.337 | 0.743 | 8.872 | 10.763 |
| 0.625949074074083 | 27.937 | 27.048 | 0.338 | 0.752 | 8.394 | 10.97 |
| 0.625960648148157 | 27.772 | 27.147 | 0.332 | 0.734 | 9.039 | 10.792 |
| 0.625972222222231 | 27.937 | 27.344 | 0.345 | 0.765 | 8.636 | 10.838 |
| 0.625983796296305 | 27.706 | 27.278 | 0.329 | 0.731 | 9.099 | 10.808 |
| 0.625995370370379 | 27.706 | 27.344 | 0.345 | 0.766 | 9.113 | 10.951 |
| 0.626006944444453 | 27.871 | 27.179 | 0.339 | 0.75 | 9.096 | 12.431 |
| 0.626018518518527 | 28.134 | 27.245 | 0.335 | 0.749 | 9.019 | 10.792 |
| 0.626030092592601 | 28.134 | 27.212 | 0.342 | 0.755 | 8.859 | 10.779 |
| 0.626041666666675 | 27.805 | 26.982 | 0.337 | 0.753 | 7.991 | 10.957 |
| 0.626053240740749 | 28.002 | 27.311 | 0.343 | 0.759 | 8.564 | 10.798 |
| 0.626064814814823 | 28.035 | 27.179 | 0.349 | 0.774 | 7.779 | 10.824 |
| 0.626076388888897 | 27.739 | 27.114 | 0.337 | 0.751 | 7.45 | 10.929 |
| 0.626087962962971 | 27.97 | 27.377 | 0.339 | 0.756 | 8.567 | 10.788 |
| 0.626099537037045 | 27.904 | 27.081 | 0.336 | 0.747 | 9.114 | 10.932 |
| 0.626111111111119 | 27.706 | 27.476 | 0.339 | 0.752 | 9.12 | 10.774 |
| 0.626122685185193 | 28.002 | 27.212 | 0.344 | 0.768 | 7.002 | 10.928 |
| 0.626134259259267 | 27.937 | 27.377 | 0.332 | 0.737 | 9.061 | 10.768 |
| 0.626145833333341 | 28.002 | 27.344 | 0.333 | 0.739 | 8.325 | 10.889 |
| 0.626157407407415 | 27.739 | 27.443 | 0.34 | 0.756 | 8.397 | 10.978 |
| 0.626168981481489 | 27.805 | 27.443 | 0.349 | 0.774 | 8.189 | 10.853 |
| 0.626180555555563 | 27.937 | 27.542 | 0.342 | 0.757 | 6.957 | 10.949 |
| 0.626192129629637 | 27.805 | 27.377 | 0.342 | 0.762 | 7.774 | 10.809 |
| 0.626203703703711 | 27.937 | 27.245 | 0.335 | 0.742 | 8.449 | 10.932 |
| 0.626215277777786 | 28.134 | 27.476 | 0.348 | 0.772 | 9.087 | 10.926 |
| 0.62622685185186 | 28.101 | 26.949 | 0.336 | 0.744 | 9.106 | 10.815 |
| 0.626238425925934 | 27.706 | 27.509 | 0.348 | 0.774 | 9.055 | 10.922 |
| 0.626250000000008 | 28.332 | 27.278 | 0.336 | 0.743 | 8.912 | 10.915 |
| 0.626261574074082 | 28.002 | 27.179 | 0.348 | 0.779 | 8.083 | 10.876 |
| 0.626273148148156 | 28.068 | 27.212 | 0.341 | 0.757 | 7.616 | 10.965 |
| 0.62628472222223 | 28.365 | 27.278 | 0.337 | 0.749 | 9.344 | 10.796 |
| 0.626296296296304 | 27.97 | 27.278 | 0.335 | 0.747 | 9.052 | 10.966 |
| 0.626307870370378 | 28.035 | 27.081 | 0.348 | 0.773 | 7.854 | 10.911 |
| 0.626319444444452 | 28.397 | 27.476 | 0.332 | 0.74 | 9.085 | 10.773 |
| 0.626331018518526 | 28.134 | 27.278 | 0.348 | 0.772 | 9.06 | 10.863 |
| 0.6263425925926 | 28.002 | 27.245 | 0.336 | 0.746 | 9.106 | 10.959 |
| 0.626354166666674 | 27.904 | 27.245 | 0.348 | 0.776 | 9.13 | 10.872 |
| 0.626365740740748 | 27.871 | 27.706 | 0.335 | 0.745 | 9.11 | 10.85 |
| 0.626377314814822 | 27.838 | 27.344 | 0.335 | 0.74 | 8.473 | 10.934 |
| 0.626388888888896 | 28.167 | 27.179 | 0.338 | 0.756 | 8.4 | 10.963 |
| 0.62640046296297 | 27.805 | 27.542 | 0.335 | 0.742 | 8.702 | 10.875 |
| 0.626412037037044 | 28.002 | 27.509 | 0.349 | 0.777 | 7.667 | 10.853 |
| 0.626423611111118 | 28.299 | 27.607 | 0.33 | 0.731 | 9.061 | 10.829 |
| 0.626435185185192 | 28.035 | 27.739 | 0.349 | 0.774 | 9.108 | 10.893 |
| 0.626446759259266 | 28.134 | 27.443 | 0.345 | 0.767 | 9.025 | 10.963 |
| 0.62645833333334 | 27.97 | 27.311 | 0.346 | 0.773 | 7.053 | 10.811 |
| 0.626469907407414 | 28.167 | 27.673 | 0.343 | 0.765 | 7.712 | 10.963 |
| 0.626481481481488 | 28.332 | 27.443 | 0.345 | 0.766 | 7.177 | 10.875 |
| 0.626493055555562 | 27.838 | 27.838 | 0.332 | 0.735 | 9.099 | 13.232 |
| 0.626504629629636 | 28.299 | 27.377 | 0.349 | 0.78 | 9.095 | 10.925 |
| 0.626516203703711 | 27.871 | 27.344 | 0.34 | 0.754 | 8.84 | 10.951 |
| 0.626527777777785 | 28.332 | 27.607 | 0.343 | 0.761 | 7.06 | 10.977 |
| 0.626539351851859 | 27.64 | 27.41 | 0.34 | 0.758 | 7.269 | 10.955 |
| 0.626550925925933 | 28.266 | 27.278 | 0.33 | 0.733 | 9.857 | 10.819 |
| 0.626562500000007 | 27.904 | 27.542 | 0.344 | 0.762 | 8.889 | 10.977 |
| 0.626574074074081 | 27.937 | 27.278 | 0.346 | 0.767 | 7.628 | 10.821 |
| 0.626585648148155 | 28.035 | 27.542 | 0.338 | 0.756 | 7.252 | 10.951 |
| 0.626597222222229 | 27.937 | 27.772 | 0.34 | 0.758 | 8.265 | 10.785 |
| 0.626608796296303 | 28.2 | 27.278 | 0.349 | 0.776 | 7.164 | 10.919 |
| 0.626620370370377 | 28.002 | 27.048 | 0.336 | 0.746 | 7.176 | 10.909 |
| 0.626631944444451 | 27.937 | 27.114 | 0.348 | 0.772 | 7.021 | 10.871 |
| 0.626643518518525 | 27.904 | 27.048 | 0.338 | 0.757 | 8.391 | 10.977 |
| 0.626655092592599 | 28.2 | 27.212 | 0.337 | 0.752 | 7.42 | 10.753 |
| 0.626666666666673 | 28.101 | 27.114 | 0.349 | 0.773 | 7.069 | 10.882 |
| 0.626678240740747 | 27.97 | 27.311 | 0.339 | 0.758 | 7.117 | 10.986 |
| 0.626689814814821 | 28.266 | 27.311 | 0.335 | 0.745 | 7.255 | 10.758 |
| 0.626701388888895 | 28.101 | 27.311 | 0.347 | 0.771 | 9.766 | 10.928 |
| 0.626712962962969 | 28.068 | 27.542 | 0.337 | 0.746 | 9.071 | 10.968 |
| 0.626724537037043 | 28.134 | 27.311 | 0.345 | 0.77 | 9.127 | 10.824 |
| 0.626736111111117 | 27.937 | 27.443 | 0.341 | 0.758 | 8.642 | 10.978 |
| 0.626747685185191 | 28.035 | 27.179 | 0.336 | 0.742 | 7.338 | 10.768 |
| 0.626759259259265 | 28.035 | 27.344 | 0.349 | 0.776 | 8.31 | 10.877 |
| 0.626770833333339 | 28.101 | 27.509 | 0.337 | 0.745 | 9.005 | 10.94 |
| 0.626782407407413 | 27.805 | 27.147 | 0.34 | 0.761 | 7.735 | 10.971 |
| 0.626793981481487 | 27.838 | 27.278 | 0.342 | 0.764 | 8.241 | 10.811 |
| 0.626805555555561 | 28.299 | 27.147 | 0.342 | 0.765 | 7.773 | 10.981 |
| 0.626817129629636 | 28.266 | 27.509 | 0.337 | 0.751 | 8.832 | 10.929 |
| 0.62682870370371 | 28.365 | 27.542 | 0.347 | 0.769 | 7.635 | 10.852 |
| 0.626840277777784 | 27.805 | 27.607 | 0.344 | 0.762 | 8.947 | 10.98 |
| 0.626851851851858 | 28.101 | 27.377 | 0.346 | 0.768 | 9.001 | 10.884 |
| 0.626863425925932 | 28.397 | 27.574 | 0.333 | 0.742 | 9.092 | 10.772 |
| 0.626875000000006 | 28.332 | 27.64 | 0.347 | 0.773 | 8.655 | 10.875 |
| 0.62688657407408 | 28.43 | 27.311 | 0.334 | 0.745 | 9.065 | 10.929 |
| 0.626898148148154 | 28.2 | 27.212 | 0.348 | 0.778 | 9.106 | 10.893 |
| 0.626909722222228 | 28.002 | 27.574 | 0.33 | 0.736 | 8.984 | 10.78 |
| 0.626921296296302 | 28.068 | 27.542 | 0.338 | 0.748 | 8.28 | 10.954 |
| 0.626932870370376 | 28.068 | 27.443 | 0.339 | 0.749 | 8.003 | 10.789 |
| 0.62694444444445 | 28.101 | 27.739 | 0.336 | 0.744 | 8.761 | 10.875 |
| 0.626956018518524 | 28.035 | 26.982 | 0.346 | 0.77 | 7.126 | 10.797 |
| 0.626967592592598 | 27.805 | 27.509 | 0.342 | 0.758 | 7.37 | 10.961 |
| 0.626979166666672 | 27.904 | 27.443 | 0.336 | 0.75 | 7.991 | 10.799 |
| 0.626990740740746 | 28.134 | 27.706 | 0.345 | 0.765 | 8.899 | 10.788 |
| 0.62700231481482 | 28.496 | 27.64 | 0.344 | 0.761 | 7.713 | 10.808 |
| 0.627013888888894 | 28.332 | 27.542 | 0.343 | 0.767 | 7.546 | 10.964 |
| 0.627025462962968 | 28.233 | 27.509 | 0.344 | 0.764 | 8.828 | 10.825 |
| 0.627037037037042 | 28.2 | 27.673 | 0.33 | 0.735 | 9.105 | 10.94 |
| 0.627048611111116 | 28.167 | 27.64 | 0.348 | 0.777 | 9.124 | 10.892 |
| 0.62706018518519 | 28.134 | 27.311 | 0.344 | 0.77 | 9.1 | 10.984 |
| 0.627071759259264 | 28.332 | 27.739 | 0.338 | 0.749 | 8.405 | 10.928 |
| 0.627083333333338 | 28.134 | 27.64 | 0.342 | 0.764 | 8.092 | 10.951 |
| 0.627094907407412 | 28.299 | 27.64 | 0.34 | 0.756 | 9.063 | 10.779 |
| 0.627106481481487 | 28.134 | 27.542 | 0.35 | 0.778 | 8.942 | 10.909 |
| 0.627118055555561 | 28.266 | 27.64 | 0.337 | 0.75 | 9.079 | 10.832 |
| 0.627129629629635 | 28.101 | 27.476 | 0.347 | 0.768 | 8.883 | 10.853 |
| 0.627141203703709 | 28.595 | 27.245 | 0.342 | 0.763 | 9.062 | 10.98 |
| 0.627152777777783 | 28.463 | 27.574 | 0.349 | 0.775 | 8.977 | 10.892 |
| 0.627164351851857 | 28.233 | 27.706 | 0.338 | 0.752 | 8.8 | 12.293 |
| 0.627175925925931 | 28.266 | 27.739 | 0.346 | 0.771 | 8.159 | 10.845 |
| 0.627187500000005 | 28.233 | 27.673 | 0.331 | 0.731 | 7.242 | 10.805 |
| 0.627199074074079 | 28.266 | 27.344 | 0.35 | 0.776 | 8.078 | 10.897 |
| 0.627210648148153 | 28.2 | 27.542 | 0.338 | 0.756 | 7.802 | 10.949 |
| 0.627222222222227 | 28.397 | 27.706 | 0.343 | 0.76 | 7.494 | 10.795 |
| 0.627233796296301 | 28.299 | 27.212 | 0.343 | 0.761 | 8.674 | 10.97 |
| 0.627245370370375 | 28.002 | 27.805 | 0.342 | 0.761 | 9.005 | 10.79 |
| 0.627256944444449 | 28.365 | 27.344 | 0.34 | 0.757 | 7.073 | 10.954 |
| 0.627268518518523 | 28.002 | 27.64 | 0.336 | 0.742 | 7.958 | 10.767 |
| 0.627280092592597 | 28.101 | 27.607 | 0.33 | 0.729 | 7.112 | 10.889 |
| 0.627291666666671 | 28.463 | 27.542 | 0.344 | 0.77 | 7.112 | 10.95 |
| 0.627303240740745 | 27.937 | 27.377 | 0.336 | 0.746 | 7.174 | 10.898 |
| 0.627314814814819 | 28.365 | 27.41 | 0.334 | 0.741 | 8.364 | 10.867 |
| 0.627326388888893 | 28.43 | 27.673 | 0.348 | 0.771 | 9.079 | 10.877 |
| 0.627337962962967 | 28.299 | 27.673 | 0.346 | 0.769 | 9.102 | 10.955 |
| 0.627349537037041 | 28.2 | 27.706 | 0.339 | 0.756 | 9.104 | 10.783 |
| 0.627361111111115 | 28.463 | 27.443 | 0.334 | 0.746 | 9.063 | 10.905 |
| 0.627372685185189 | 28.035 | 27.542 | 0.346 | 0.768 | 8.916 | 10.87 |
| 0.627384259259263 | 28.167 | 27.41 | 0.342 | 0.764 | 9.092 | 10.967 |
| 0.627395833333337 | 28.2 | 27.574 | 0.344 | 0.768 | 9.114 | 10.792 |
| 0.627407407407412 | 28.2 | 27.377 | 0.348 | 0.776 | 0.629 | 10.91 |
| 0.627418981481486 | 28.299 | 27.64 | 0.342 | 0.763 | 0.633 | 10.94 |
| 0.62743055555556 | 28.233 | 28.068 | 0.343 | 0.767 | 0.617 | 10.917 |
| 0.627442129629634 | 28.134 | 27.871 | 0.34 | 0.759 | 7.248 | 10.834 |
| 0.627453703703708 | 28.266 | 28.002 | 0.341 | 0.763 | 7.755 | 10.957 |
| 0.627465277777782 | 28.628 | 27.871 | 0.344 | 0.766 | 8.848 | 10.934 |
| 0.627476851851856 | 28.397 | 27.772 | 0.346 | 0.766 | 8.701 | 10.833 |
| 0.62748842592593 | 28.496 | 27.509 | 0.345 | 0.768 | 7.727 | 10.962 |
| 0.627500000000004 | 28.529 | 27.64 | 0.332 | 0.742 | 8.19 | 10.764 |
| 0.627511574074078 | 28.134 | 27.607 | 0.348 | 0.775 | 8.439 | 10.863 |
| 0.627523148148152 | 28.299 | 27.838 | 0.342 | 0.763 | 8.327 | 10.974 |
| 0.627534722222226 | 28.463 | 27.772 | 0.335 | 0.743 | 7.096 | 13.077 |
| 0.6275462962963 | 28.463 | 27.542 | 0.343 | 0.765 | 0.565 | 10.965 |
| 0.627557870370374 | 28.397 | 27.97 | 0.345 | 0.768 | 8.426 | 10.855 |
| 0.627569444444448 | 28.332 | 27.838 | 0.343 | 0.762 | 8.85 | 10.857 |
| 0.627581018518522 | 28.299 | 27.772 | 0.345 | 0.768 | 9.083 | 10.837 |
| 0.627592592592596 | 28.562 | 27.97 | 0.336 | 0.745 | 8.145 | 10.956 |
| 0.62760416666667 | 28.496 | 27.937 | 0.348 | 0.774 | 8.31 | 10.872 |
| 0.627615740740744 | 28.529 | 27.772 | 0.336 | 0.749 | 8.457 | 10.824 |
| 0.627627314814818 | 28.101 | 27.904 | 0.341 | 0.765 | 0.628 | 10.963 |
| 0.627638888888892 | 28.397 | 27.739 | 0.333 | 0.737 | 8.022 | 10.942 |
| 0.627650462962966 | 28.365 | 27.97 | 0.336 | 0.743 | 8.254 | 10.898 |
| 0.62766203703704 | 28.792 | 27.574 | 0.344 | 0.768 | 0.625 | 10.95 |
| 0.627673611111114 | 28.365 | 27.97 | 0.345 | 0.772 | 0.564 | 10.88 |
| 0.627685185185188 | 28.463 | 27.805 | 0.331 | 0.742 | 0.643 | 10.953 |
| 0.627696759259262 | 28.727 | 27.871 | 0.336 | 0.751 | 7.121 | 10.974 |
| 0.627708333333337 | 28.496 | 28.233 | 0.333 | 0.736 | 8.536 | 13.252 |
| 0.627719907407411 | 28.43 | 28.266 | 0.338 | 0.756 | 0.611 | 10.792 |
| 0.627731481481485 | 28.562 | 28.002 | 0.334 | 0.747 | 0.629 | 10.792 |
| 0.627743055555559 | 28.628 | 28.233 | 0.341 | 0.756 | 7.026 | 10.947 |
| 0.627754629629633 | 28.496 | 28.463 | 0.329 | 0.727 | 7.214 | 10.761 |
| 0.627766203703707 | 28.332 | 28.332 | 0.344 | 0.767 | 9.479 | 10.928 |
| 0.627777777777781 | 28.496 | 28.101 | 0.338 | 0.748 | 7.349 | 10.965 |
| 0.627789351851855 | 28.332 | 28.035 | 0.346 | 0.776 | 7.053 | 10.906 |
| 0.627800925925929 | 28.661 | 27.871 | 0.337 | 0.754 | 0.643 | 10.771 |
| 0.627812500000003 | 28.463 | 28.068 | 0.336 | 0.748 | 0.602 | 12.149 |
| 0.627824074074077 | 28.397 | 28.2 | 0.344 | 0.773 | 0.649 | 10.882 |
| 0.627835648148151 | 28.496 | 28.2 | 0.326 | 0.729 | 0.619 | 10.78 |
| 0.627847222222225 | 28.463 | 28.332 | 0.342 | 0.764 | 6.731 | 10.889 |
| 0.627858796296299 | 28.562 | 28.43 | 0.342 | 0.758 | 7.642 | 10.934 |
| 0.627870370370373 | 28.365 | 28.694 | 0.334 | 0.741 | 8.902 | 10.943 |
| 0.627881944444447 | 28.496 | 28.595 | 0.335 | 0.742 | 7.757 | 10.893 |
| 0.627893518518521 | 28.595 | 27.772 | 0.331 | 0.738 | 8.371 | 10.786 |
| 0.627905092592595 | 28.365 | 28.068 | 0.34 | 0.755 | 9.058 | 10.77 |
| 0.627916666666669 | 28.694 | 27.937 | 0.339 | 0.76 | 0.765 | 10.961 |
| 0.627928240740743 | 28.332 | 28.167 | 0.343 | 0.77 | 0.634 | 10.872 |
| 0.627939814814817 | 28.595 | 28.233 | 0.336 | 0.747 | 0.592 | 10.967 |
| 0.627951388888891 | 28.43 | 27.97 | 0.338 | 0.759 | 0.603 | 10.966 |
| 0.627962962962965 | 28.496 | 28.595 | 0.327 | 0.729 | 0.603 | 10.903 |
| 0.627974537037039 | 28.727 | 28.562 | 0.339 | 0.758 | 6.31 | 10.837 |
| 0.627986111111113 | 28.365 | 28.694 | 0.343 | 0.768 | 8.359 | 10.822 |
| 0.627997685185188 | 28.562 | 28.101 | 0.343 | 0.767 | 7.102 | 10.935 |
| 0.628009259259262 | 28.661 | 28.43 | 0.345 | 0.765 | 8.672 | 10.801 |
| 0.628020833333336 | 28.43 | 28.529 | 0.335 | 0.75 | 0.855 | 10.93 |
| 0.62803240740741 | 28.628 | 28.332 | 0.344 | 0.77 | 0.593 | 10.918 |
| 0.628043981481484 | 28.43 | 28.299 | 0.331 | 0.738 | 0.611 | 10.858 |
| 0.628055555555558 | 28.792 | 28.299 | 0.339 | 0.758 | 0.643 | 10.956 |
| 0.628067129629632 | 28.496 | 28.562 | 0.328 | 0.737 | 0.59 | 10.948 |
| 0.628078703703706 | 28.661 | 28.76 | 0.33 | 0.728 | 6.441 | 12.228 |
| 0.62809027777778 | 28.891 | 28.957 | 0.339 | 0.758 | 0.98 | 10.961 |
| 0.628101851851854 | 28.463 | 28.924 | 0.34 | 0.765 | 0.643 | 10.873 |
| 0.628113425925928 | 28.397 | 29.089 | 0.335 | 0.748 | 0.645 | 10.967 |
| 0.628125000000002 | 28.727 | 28.924 | 0.333 | 0.747 | 0.617 | 10.987 |
| 0.628136574074076 | 28.661 | 29.089 | 0.333 | 0.74 | 6.337 | 10.957 |
| 0.62814814814815 | 28.628 | 28.858 | 0.34 | 0.757 | 8.289 | 10.784 |
| 0.628159722222224 | 28.496 | 29.089 | 0.346 | 0.769 | 7.833 | 10.837 |
| 0.628171296296298 | 28.628 | 28.661 | 0.336 | 0.745 | 7.759 | 10.743 |
| 0.628182870370372 | 28.463 | 28.463 | 0.343 | 0.768 | 9.088 | 10.941 |
| 0.628194444444446 | 28.463 | 28.233 | 0.329 | 0.73 | 0.865 | 10.814 |
| 0.62820601851852 | 28.661 | 28.43 | 0.331 | 0.737 | 0.635 | 10.93 |
| 0.628217592592594 | 28.76 | 28.529 | 0.341 | 0.764 | 0.638 | 10.924 |
| 0.628229166666668 | 28.299 | 28.661 | 0.342 | 0.763 | 0.611 | 10.844 |
| 0.628240740740742 | 28.595 | 28.957 | 0.339 | 0.762 | 0.639 | 10.884 |
| 0.628252314814816 | 28.825 | 29.023 | 0.327 | 0.73 | 0.627 | 10.885 |
| 0.62826388888889 | 28.661 | 29.056 | 0.339 | 0.762 | 0.634 | 10.92 |
| 0.628275462962964 | 28.628 | 29.023 | 0.327 | 0.728 | 0.569 | 10.756 |
| 0.628287037037038 | 28.694 | 28.99 | 0.326 | 0.729 | 0.65 | 10.953 |
| 0.628298611111113 | 28.595 | 28.858 | 0.32 | 0.715 | 0.632 | 10.8 |
| 0.628310185185187 | 28.76 | 29.122 | 0.335 | 0.754 | 0.599 | 10.946 |
| 0.628321759259261 | 28.957 | 28.957 | 0.323 | 0.722 | 0.62 | 10.83 |
| 0.628333333333335 | 28.825 | 28.595 | 0.325 | 0.72 | 6.184 | 13.137 |
| 0.628344907407409 | 28.825 | 28.99 | 0.339 | 0.755 | 7.085 | 10.809 |
| 0.628356481481483 | 28.727 | 28.825 | 0.328 | 0.733 | 8.845 | 10.849 |
| 0.628368055555557 | 28.694 | 28.332 | 0.329 | 0.735 | 9.122 | 10.769 |
| 0.628379629629631 | 28.76 | 28.266 | 0.349 | 0.781 | 8.986 | 10.886 |
| 0.628391203703705 | 28.496 | 28.167 | 0.346 | 0.77 | 7.976 | 10.913 |
| 0.628402777777779 | 28.529 | 28.134 | 0.332 | 0.74 | 7.148 | 12.852 |
| 0.628414351851853 | 28.496 | 28.2 | 0.348 | 0.777 | 9.488 | 10.903 |
| 0.628425925925927 | 28.694 | 28.233 | 0.334 | 0.743 | 0.634 | 10.763 |
| 0.628437500000001 | 28.595 | 28.924 | 0.341 | 0.765 | 0.604 | 10.84 |
| 0.628449074074075 | 29.056 | 28.957 | 0.329 | 0.736 | 0.655 | 10.769 |
| 0.628460648148149 | 28.858 | 28.694 | 0.324 | 0.722 | 0.628 | 10.79 |
| 0.628472222222223 | 28.792 | 28.924 | 0.338 | 0.757 | 0.653 | 10.853 |
| 0.628483796296297 | 28.463 | 29.155 | 0.325 | 0.728 | 0.637 | 10.909 |
| 0.628495370370371 | 28.661 | 29.122 | 0.338 | 0.76 | 0.627 | 10.939 |
| 0.628506944444445 | 28.99 | 28.858 | 0.333 | 0.744 | 0.619 | 10.781 |
| 0.628518518518519 | 28.661 | 29.22 | 0.334 | 0.746 | 0.615 | 10.798 |
| 0.628530092592593 | 28.792 | 28.858 | 0.333 | 0.744 | 0.563 | 10.971 |
| 0.628541666666667 | 28.858 | 28.957 | 0.317 | 0.709 | 0.589 | 10.811 |
| 0.628553240740741 | 28.924 | 28.891 | 0.323 | 0.719 | 0.618 | 10.76 |
| 0.628564814814815 | 28.924 | 29.22 | 0.334 | 0.748 | 0.616 | 10.902 |
| 0.628576388888889 | 28.43 | 29.286 | 0.325 | 0.728 | 0.637 | 10.754 |
| 0.628587962962963 | 28.792 | 29.22 | 0.329 | 0.736 | 0.622 | 10.993 |
| 0.628599537037038 | 28.99 | 28.99 | 0.331 | 0.743 | 0.618 | 10.807 |
| 0.628611111111112 | 28.529 | 29.188 | 0.322 | 0.723 | 0.605 | 10.871 |
| 0.628622685185186 | 28.76 | 29.22 | 0.337 | 0.758 | 0.645 | 10.907 |
| 0.62863425925926 | 28.628 | 29.122 | 0.324 | 0.726 | 0.648 | 10.962 |
| 0.628645833333334 | 28.825 | 29.056 | 0.324 | 0.721 | 0.639 | 10.772 |
| 0.628657407407408 | 28.858 | 28.924 | 0.336 | 0.754 | 0.628 | 10.883 |
| 0.628668981481482 | 28.792 | 29.188 | 0.33 | 0.742 | 0.642 | 10.974 |
| 0.628680555555556 | 28.529 | 28.825 | 0.322 | 0.717 | 0.58 | 12.299 |
| 0.62869212962963 | 28.825 | 29.056 | 0.337 | 0.758 | 0.639 | 10.885 |
| 0.628703703703704 | 28.562 | 29.056 | 0.328 | 0.734 | 0.599 | 11.008 |
| 0.628715277777778 | 28.694 | 28.891 | 0.336 | 0.744 | 6.8 | 10.973 |
| 0.628726851851852 | 28.463 | 28.891 | 0.343 | 0.761 | 7.27 | 10.884 |
| 0.628738425925926 | 28.76 | 28.858 | 0.334 | 0.741 | 8.598 | 10.932 |
| 0.62875 | 28.891 | 28.661 | 0.344 | 0.768 | 0.651 | 10.878 |